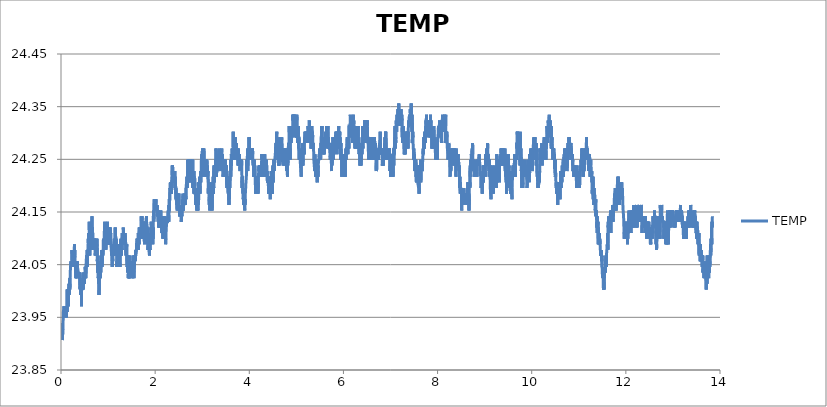
| Category | TEMP |
|---|---|
| 0.01620481575 | 23.917 |
| 0.019264157416666667 | 23.917 |
| 0.022323499055555557 | 23.939 |
| 0.025382562916666667 | 23.907 |
| 0.028442737944444445 | 23.917 |
| 0.03150207961111111 | 23.939 |
| 0.03456142125 | 23.917 |
| 0.03762076291666666 | 23.917 |
| 0.040680104555555555 | 23.928 |
| 0.04373944622222222 | 23.939 |
| 0.04679878786111111 | 23.939 |
| 0.04985785172222222 | 23.96 |
| 0.05291747116666667 | 23.96 |
| 0.055977090611111106 | 23.96 |
| 0.05903643225 | 23.96 |
| 0.062096329500000005 | 23.96 |
| 0.0651553933611111 | 23.971 |
| 0.0682155683888889 | 23.971 |
| 0.07127546561111112 | 23.971 |
| 0.07433452947222222 | 23.95 |
| 0.07739387113888889 | 23.96 |
| 0.08045349058333334 | 23.96 |
| 0.08351283222222222 | 23.95 |
| 0.0865721738888889 | 23.96 |
| 0.08963123775 | 23.95 |
| 0.09269085719444445 | 23.96 |
| 0.09575019883333334 | 23.95 |
| 0.09880926269444444 | 23.96 |
| 0.10186999330555556 | 23.95 |
| 0.10492933497222222 | 23.96 |
| 0.10798839880555555 | 23.96 |
| 0.11104774047222221 | 23.95 |
| 0.11410735991666666 | 23.971 |
| 0.11716781274999999 | 23.971 |
| 0.12022715438888888 | 23.971 |
| 0.12328677383333334 | 23.96 |
| 0.12634611547222221 | 23.971 |
| 0.12940545713888887 | 23.96 |
| 0.132464521 | 24.003 |
| 0.13552441822222222 | 23.971 |
| 0.13858375988888888 | 23.992 |
| 0.1416431015277778 | 23.971 |
| 0.14470244319444445 | 23.982 |
| 0.14776178483333335 | 23.982 |
| 0.15082112649999999 | 24.003 |
| 0.15388157930555554 | 23.992 |
| 0.15694064316666667 | 23.971 |
| 0.15999998483333333 | 23.992 |
| 0.1630604376388889 | 23.992 |
| 0.16611977930555558 | 24.003 |
| 0.16917884316666668 | 24.014 |
| 0.17223790700000002 | 23.992 |
| 0.17529752644444443 | 24.003 |
| 0.1783568681111111 | 24.014 |
| 0.18141593197222222 | 24.014 |
| 0.18447527361111113 | 24.024 |
| 0.18753461527777776 | 24.003 |
| 0.1905936791111111 | 24.014 |
| 0.19365274297222224 | 24.024 |
| 0.19671264022222223 | 24.035 |
| 0.19977198186111111 | 24.035 |
| 0.20283104572222224 | 24.046 |
| 0.20589010958333334 | 24.046 |
| 0.20894945125 | 24.046 |
| 0.21200934847222222 | 24.057 |
| 0.21506924572222222 | 24.057 |
| 0.21812969852777778 | 24.046 |
| 0.22118904019444444 | 24.046 |
| 0.22424865963888888 | 24.046 |
| 0.22730800127777778 | 24.057 |
| 0.23036706513888888 | 24.046 |
| 0.23342696238888888 | 24.078 |
| 0.2364863040277778 | 24.078 |
| 0.2395453678888889 | 24.078 |
| 0.24260498733333333 | 24.057 |
| 0.2456643289722222 | 24.078 |
| 0.2487236706388889 | 24.057 |
| 0.2517830122777778 | 24.067 |
| 0.2548429095277778 | 24.046 |
| 0.25790225116666665 | 24.057 |
| 0.2609618706111111 | 24.078 |
| 0.2640209344722222 | 24.078 |
| 0.2670802761388889 | 24.078 |
| 0.27013934 | 24.057 |
| 0.2731992372222222 | 24.078 |
| 0.2762583010833333 | 24.078 |
| 0.27931792052777776 | 24.067 |
| 0.2823772621666667 | 24.078 |
| 0.2854374372222222 | 24.089 |
| 0.2884970566666667 | 24.057 |
| 0.2915566761111111 | 24.078 |
| 0.29461657333333335 | 24.067 |
| 0.2976756371944444 | 24.067 |
| 0.30073497883333333 | 24.046 |
| 0.3037940426944445 | 24.046 |
| 0.3068533843611111 | 24.057 |
| 0.309912726 | 24.035 |
| 0.31297429 | 24.046 |
| 0.31604002091666666 | 24.024 |
| 0.3190996403611111 | 24.046 |
| 0.3221592598055556 | 24.057 |
| 0.32521887925 | 24.046 |
| 0.3282796098611111 | 24.035 |
| 0.3313403404722222 | 24.046 |
| 0.33440023772222227 | 24.046 |
| 0.3374601349722222 | 24.046 |
| 0.34052086558333333 | 24.024 |
| 0.34358131841666667 | 24.057 |
| 0.3466417712222222 | 24.057 |
| 0.3497011128888889 | 24.046 |
| 0.3527632324722222 | 24.046 |
| 0.3558228519166667 | 24.046 |
| 0.35888330475 | 24.046 |
| 0.36194570211111116 | 24.046 |
| 0.36501421097222225 | 24.046 |
| 0.36807605275 | 24.035 |
| 0.37114261705555557 | 24.024 |
| 0.3742025142777778 | 24.024 |
| 0.3772626893055555 | 24.024 |
| 0.38032453111111114 | 24.024 |
| 0.3833844283333333 | 24.035 |
| 0.38644543675 | 24.035 |
| 0.38950700075 | 24.024 |
| 0.3925688425555556 | 24.035 |
| 0.39562985097222225 | 24.035 |
| 0.3986961374722222 | 24.014 |
| 0.40175603469444443 | 24.003 |
| 0.40481593194444443 | 24.003 |
| 0.4078777737222222 | 24.003 |
| 0.41093878213888885 | 24.014 |
| 0.4139986793888889 | 24.003 |
| 0.41705913219444446 | 24.003 |
| 0.42011875163888884 | 23.992 |
| 0.42317809330555556 | 24.003 |
| 0.42623743494444444 | 24.003 |
| 0.4292970543888889 | 23.992 |
| 0.4323566738333333 | 24.003 |
| 0.43541712666666665 | 23.971 |
| 0.43847674611111115 | 24.003 |
| 0.4415388656944444 | 24.014 |
| 0.4445984851388889 | 24.003 |
| 0.44765782680555555 | 24.003 |
| 0.4507188352222222 | 24.003 |
| 0.45378539949999996 | 24.014 |
| 0.4568447411388889 | 24.014 |
| 0.4599040828055555 | 24.003 |
| 0.46296370225 | 24.024 |
| 0.46602415505555556 | 24.035 |
| 0.4690837745 | 24.003 |
| 0.4721433939722222 | 24.003 |
| 0.4752024578055556 | 24.003 |
| 0.4782617994722222 | 24.003 |
| 0.48132225230555553 | 24.003 |
| 0.48438187175 | 24.024 |
| 0.48744093558333335 | 24.014 |
| 0.4905005550277778 | 24.024 |
| 0.49355989669444444 | 24.024 |
| 0.49661896055555554 | 24.014 |
| 0.4996791355833333 | 24.024 |
| 0.5027387550277778 | 24.035 |
| 0.5057980966666666 | 24.035 |
| 0.5088577161111111 | 24.035 |
| 0.5119170577777777 | 24.024 |
| 0.5149763994166666 | 24.046 |
| 0.5180357410833333 | 24.046 |
| 0.5210950827222223 | 24.035 |
| 0.5241549799722222 | 24.046 |
| 0.5272143216111111 | 24.024 |
| 0.5302736632777778 | 24.046 |
| 0.5333330049166667 | 24.046 |
| 0.5363920687777778 | 24.057 |
| 0.5394514104166667 | 24.057 |
| 0.5425110298611111 | 24.067 |
| 0.5455706493055555 | 24.057 |
| 0.5486299909722222 | 24.067 |
| 0.5516904437777778 | 24.067 |
| 0.5547497854444444 | 24.057 |
| 0.5578096826666666 | 24.078 |
| 0.5608693021111111 | 24.046 |
| 0.5639291993611111 | 24.078 |
| 0.5669888188055555 | 24.067 |
| 0.5700489938333333 | 24.078 |
| 0.5731083355 | 24.078 |
| 0.5761676771388888 | 24.089 |
| 0.5792275743888889 | 24.099 |
| 0.5822869160277778 | 24.089 |
| 0.5853487578333333 | 24.11 |
| 0.5884086550555556 | 24.099 |
| 0.5914679967222223 | 24.089 |
| 0.5945273383611112 | 24.099 |
| 0.5975869578055555 | 24.11 |
| 0.60064657725 | 24.131 |
| 0.6037061966944445 | 24.11 |
| 0.6067652605555556 | 24.121 |
| 0.60982488 | 24.067 |
| 0.6128842216388889 | 24.089 |
| 0.6159438410833333 | 24.089 |
| 0.6190029049444444 | 24.089 |
| 0.6220628021944444 | 24.11 |
| 0.6251221438333333 | 24.121 |
| 0.6281820410833333 | 24.11 |
| 0.6312411049444444 | 24.099 |
| 0.634300724388889 | 24.089 |
| 0.6373608994166666 | 24.078 |
| 0.6404199632777777 | 24.121 |
| 0.6434793049166666 | 24.131 |
| 0.6465386465833333 | 24.089 |
| 0.6495990993888889 | 24.11 |
| 0.6526584410555555 | 24.099 |
| 0.6557175049166666 | 24.11 |
| 0.6587768465555556 | 24.142 |
| 0.6618359104166667 | 24.099 |
| 0.6648949742777778 | 24.121 |
| 0.6679545937222223 | 24.099 |
| 0.6710139353611111 | 24.121 |
| 0.6740732770277779 | 24.089 |
| 0.6771323408888889 | 24.099 |
| 0.6801922381111111 | 24.099 |
| 0.6832515797777777 | 24.089 |
| 0.6863109214166666 | 24.078 |
| 0.6893699852777778 | 24.089 |
| 0.6924296047222221 | 24.089 |
| 0.6954892241666667 | 24.089 |
| 0.6985499547777778 | 24.099 |
| 0.7016106854166666 | 24.089 |
| 0.7046700270555555 | 24.078 |
| 0.7077302020833333 | 24.099 |
| 0.7107903771111111 | 24.089 |
| 0.7138497187777778 | 24.078 |
| 0.7169090604166667 | 24.099 |
| 0.7199684020833333 | 24.089 |
| 0.7230277437222222 | 24.078 |
| 0.7260868075833333 | 24.089 |
| 0.7291461492222222 | 24.067 |
| 0.7322060464722222 | 24.078 |
| 0.7352651103333334 | 24.089 |
| 0.7383244519722223 | 24.078 |
| 0.741383793638889 | 24.078 |
| 0.7444439686666667 | 24.078 |
| 0.7475030325277777 | 24.078 |
| 0.7505623741666667 | 24.089 |
| 0.7536222714166667 | 24.099 |
| 0.756681890861111 | 24.078 |
| 0.7597412324999999 | 24.067 |
| 0.7628005741666666 | 24.089 |
| 0.765859638 | 24.099 |
| 0.7689189796666668 | 24.067 |
| 0.7719780435277778 | 24.057 |
| 0.7750371073888889 | 24.067 |
| 0.7780964490277777 | 24.057 |
| 0.7811560684722223 | 24.035 |
| 0.7842151323333333 | 24.057 |
| 0.7872805854444445 | 24.035 |
| 0.7903402048888889 | 24.046 |
| 0.7934001021111111 | 24.024 |
| 0.7964627773055555 | 24.035 |
| 0.7995229523333333 | 24.035 |
| 0.8025836829444445 | 24.014 |
| 0.8056483026944444 | 24.024 |
| 0.8087073665277777 | 23.992 |
| 0.8117678193611111 | 24.014 |
| 0.8148282721944444 | 24.046 |
| 0.8179112263055556 | 24.035 |
| 0.8210047365833334 | 24.035 |
| 0.8240715786666667 | 24.046 |
| 0.8271378651388889 | 24.024 |
| 0.8302341533611111 | 24.035 |
| 0.8332948839722222 | 24.024 |
| 0.8363586703333333 | 24.024 |
| 0.8394296793055556 | 24.035 |
| 0.8424995771111111 | 24.046 |
| 0.8455630856666667 | 24.035 |
| 0.8486377059722222 | 24.067 |
| 0.8517070481944444 | 24.057 |
| 0.8547772238055555 | 24.046 |
| 0.8578462882222223 | 24.046 |
| 0.8609147970833333 | 24.057 |
| 0.8639855282777777 | 24.057 |
| 0.8670629264999999 | 24.078 |
| 0.8701283796111111 | 24.078 |
| 0.8731957772777778 | 24.046 |
| 0.8762559523055555 | 24.078 |
| 0.8793405731944444 | 24.057 |
| 0.882412971138889 | 24.067 |
| 0.8854831467500001 | 24.078 |
| 0.888550266611111 | 24.067 |
| 0.8916207200277778 | 24.067 |
| 0.89468533975 | 24.078 |
| 0.8977502372777778 | 24.078 |
| 0.9008168015555555 | 24.099 |
| 0.9038803101111111 | 24.078 |
| 0.9069743759722222 | 24.078 |
| 0.9100401068888888 | 24.078 |
| 0.9131016708888888 | 24.089 |
| 0.9161707353055556 | 24.099 |
| 0.9192364662222222 | 24.11 |
| 0.9223096975555556 | 24.11 |
| 0.9253823733055555 | 24.121 |
| 0.92844671525 | 24.121 |
| 0.9315141129166666 | 24.131 |
| 0.9346031784722223 | 24.089 |
| 0.93768391025 | 24.078 |
| 0.9407485299722222 | 24.089 |
| 0.9438209279166666 | 24.099 |
| 0.9468924925 | 24.11 |
| 0.9499568344444445 | 24.11 |
| 0.9530231209166666 | 24.078 |
| 0.9560907963888889 | 24.099 |
| 0.9591590274444444 | 24.11 |
| 0.9622339255277779 | 24.089 |
| 0.9653029899722223 | 24.089 |
| 0.9683670541111111 | 24.089 |
| 0.9714330628055556 | 24.089 |
| 0.9744946268055557 | 24.121 |
| 0.9775598021111112 | 24.099 |
| 0.9806277553888889 | 24.099 |
| 0.9836982087777778 | 24.11 |
| 0.9867617173333334 | 24.131 |
| 0.9898296705833333 | 24.089 |
| 0.9929040130833333 | 24.099 |
| 0.9959686328333333 | 24.089 |
| 0.9990457532777778 | 24.121 |
| 1.0021114841666665 | 24.11 |
| 1.0051797152222222 | 24.089 |
| 1.0082732255 | 24.099 |
| 1.0113453456666666 | 24.11 |
| 1.0144141323055555 | 24.11 |
| 1.017506531388889 | 24.099 |
| 1.0205739290555556 | 24.089 |
| 1.0236579943333333 | 24.099 |
| 1.02672372525 | 24.089 |
| 1.029811401861111 | 24.089 |
| 1.032892967 | 24.089 |
| 1.0359750877222222 | 24.121 |
| 1.0390497080277779 | 24.089 |
| 1.0421309953888889 | 24.099 |
| 1.0452078380277778 | 24.11 |
| 1.0482696798333333 | 24.121 |
| 1.0513426333611111 | 24.089 |
| 1.0544441996666667 | 24.11 |
| 1.05753659875 | 24.099 |
| 1.0606017740833333 | 24.089 |
| 1.0636813946666666 | 24.089 |
| 1.0667543481944444 | 24.089 |
| 1.0698203569166667 | 24.089 |
| 1.072900810861111 | 24.089 |
| 1.0759909876111111 | 24.067 |
| 1.079068385861111 | 24.067 |
| 1.0821452285 | 24.078 |
| 1.0852242935 | 24.078 |
| 1.0883314156666666 | 24.046 |
| 1.0913993689166668 | 24.057 |
| 1.0944737114444445 | 24.078 |
| 1.0975466649722223 | 24.057 |
| 1.1006465645 | 24.057 |
| 1.1037395191944444 | 24.078 |
| 1.1068299737222222 | 24.067 |
| 1.1099054274166666 | 24.089 |
| 1.1130056047222223 | 24.067 |
| 1.1160841141388889 | 24.067 |
| 1.1191570676944445 | 24.078 |
| 1.1222719680833333 | 24.078 |
| 1.1253426992777777 | 24.089 |
| 1.1284198197222222 | 24.089 |
| 1.1314986069166666 | 24.099 |
| 1.1345998954166667 | 24.078 |
| 1.1376775714444445 | 24.089 |
| 1.1407677481944445 | 24.089 |
| 1.143864592 | 24.067 |
| 1.1469633803333332 | 24.099 |
| 1.150034667111111 | 24.089 |
| 1.1530981756666667 | 24.121 |
| 1.1561677956944443 | 24.078 |
| 1.1592404714444446 | 24.11 |
| 1.1623070357222223 | 24.11 |
| 1.1653749889722222 | 24.078 |
| 1.1684454423888888 | 24.089 |
| 1.17151728475 | 24.099 |
| 1.1745807933055554 | 24.078 |
| 1.1776495799444446 | 24.078 |
| 1.1807283671388888 | 24.078 |
| 1.183796876 | 24.067 |
| 1.1868745520277777 | 24.046 |
| 1.1899419496944446 | 24.057 |
| 1.1930087917777779 | 24.046 |
| 1.1960803563333333 | 24.089 |
| 1.199141086972222 | 24.067 |
| 1.2022040399166667 | 24.057 |
| 1.2052689374444445 | 24.078 |
| 1.2083402242222223 | 24.067 |
| 1.2114126221944443 | 24.078 |
| 1.2144758529444446 | 24.067 |
| 1.2175410282777777 | 24.067 |
| 1.2206195376666666 | 24.067 |
| 1.2236849907777776 | 24.067 |
| 1.226747110388889 | 24.078 |
| 1.2298114523055557 | 24.089 |
| 1.2328738496944445 | 24.067 |
| 1.2359351359166666 | 24.067 |
| 1.2390130897222222 | 24.078 |
| 1.2420793762222222 | 24.078 |
| 1.2451409402222222 | 24.078 |
| 1.2482086156944443 | 24.089 |
| 1.25127212425 | 24.046 |
| 1.2543372995555557 | 24.078 |
| 1.2574005303333333 | 24.078 |
| 1.2604654278333334 | 24.089 |
| 1.2635375480000002 | 24.089 |
| 1.2666024455277778 | 24.078 |
| 1.2696676208333333 | 24.078 |
| 1.2727280736666666 | 24.099 |
| 1.27579491575 | 24.099 |
| 1.2788553685833333 | 24.067 |
| 1.2819174881666666 | 24.078 |
| 1.2849804411388888 | 24.089 |
| 1.2880447830833333 | 24.078 |
| 1.2911080138333333 | 24.089 |
| 1.2941693000277776 | 24.078 |
| 1.297237808888889 | 24.089 |
| 1.3002988173055554 | 24.11 |
| 1.3033606590833333 | 24.099 |
| 1.3064227786666667 | 24.11 |
| 1.3094862872222222 | 24.099 |
| 1.3125764639722222 | 24.11 |
| 1.315646917388889 | 24.089 |
| 1.3187112593055557 | 24.099 |
| 1.3217733789166666 | 24.099 |
| 1.3248496659722224 | 24.121 |
| 1.3279128967222222 | 24.089 |
| 1.3309814055833333 | 24.089 |
| 1.334059081611111 | 24.099 |
| 1.3371187010555556 | 24.099 |
| 1.34018470975 | 24.11 |
| 1.34324627375 | 24.11 |
| 1.3463556182499998 | 24.11 |
| 1.3494169044722222 | 24.11 |
| 1.3524768016944444 | 24.11 |
| 1.35555447775 | 24.11 |
| 1.358627986861111 | 24.089 |
| 1.3617020515833331 | 24.11 |
| 1.3647708382222221 | 24.089 |
| 1.3678396248611113 | 24.089 |
| 1.370907578111111 | 24.099 |
| 1.373972475638889 | 24.089 |
| 1.3770398733055558 | 24.078 |
| 1.38009949275 | 24.067 |
| 1.3831646680555556 | 24.089 |
| 1.3862278988333332 | 24.078 |
| 1.3892891850277778 | 24.067 |
| 1.392348804472222 | 24.067 |
| 1.395409812888889 | 24.089 |
| 1.39852137975 | 24.089 |
| 1.4015904441666667 | 24.057 |
| 1.4046672868333334 | 24.046 |
| 1.4077335733333334 | 24.067 |
| 1.4108006931944443 | 24.046 |
| 1.41386420175 | 24.057 |
| 1.4169260435555555 | 24.057 |
| 1.419986496361111 | 24.035 |
| 1.4230477825833332 | 24.057 |
| 1.4261240696388888 | 24.046 |
| 1.4291925784722221 | 24.024 |
| 1.432258864972222 | 24.035 |
| 1.4353254292777777 | 24.035 |
| 1.4383958826666667 | 24.046 |
| 1.4414757810555556 | 24.057 |
| 1.4445415119444445 | 24.024 |
| 1.447609743 | 24.067 |
| 1.450673807138889 | 24.024 |
| 1.4537331488055556 | 24.046 |
| 1.4567994352777778 | 24.035 |
| 1.45986238825 | 24.046 |
| 1.462932008277778 | 24.035 |
| 1.4659946834444446 | 24.046 |
| 1.4690679147777779 | 24.046 |
| 1.4721311455555555 | 24.057 |
| 1.4751918761666667 | 24.057 |
| 1.4782526067777777 | 24.057 |
| 1.4813763965555555 | 24.046 |
| 1.4844396273333333 | 24.046 |
| 1.4875009135277777 | 24.057 |
| 1.4905641443055555 | 24.046 |
| 1.4936376534166667 | 24.046 |
| 1.4967033843333333 | 24.035 |
| 1.499776337861111 | 24.046 |
| 1.5028492914166665 | 24.046 |
| 1.505911411 | 24.046 |
| 1.5089813088055555 | 24.035 |
| 1.5120500954444445 | 24.046 |
| 1.5151147151666666 | 24.024 |
| 1.51817683475 | 24.046 |
| 1.5212372875833333 | 24.046 |
| 1.5242988515833333 | 24.035 |
| 1.5273584710277777 | 24.046 |
| 1.5304194794444446 | 24.067 |
| 1.5334807656388887 | 24.046 |
| 1.5365401073055556 | 24.046 |
| 1.5396027824722223 | 24.057 |
| 1.5426624019166666 | 24.035 |
| 1.5457264660555554 | 24.046 |
| 1.5487919191666666 | 24.035 |
| 1.5518590390555556 | 24.024 |
| 1.5549247699444444 | 24.057 |
| 1.5579846671944446 | 24.046 |
| 1.5610467867777778 | 24.046 |
| 1.5641205736944443 | 24.067 |
| 1.5671824155 | 24.067 |
| 1.5702423127222223 | 24.067 |
| 1.5733049879166667 | 24.067 |
| 1.5763643295555554 | 24.067 |
| 1.5794250601666666 | 24.057 |
| 1.5824849574166668 | 24.078 |
| 1.5855451324444445 | 24.067 |
| 1.588609474388889 | 24.067 |
| 1.5916727051388888 | 24.067 |
| 1.5947353803333333 | 24.067 |
| 1.5977974999166669 | 24.067 |
| 1.6008579527500002 | 24.078 |
| 1.6039203501111112 | 24.089 |
| 1.6069816363333334 | 24.089 |
| 1.610041811361111 | 24.089 |
| 1.6131008752222222 | 24.089 |
| 1.616163550388889 | 24.099 |
| 1.6192253921944444 | 24.099 |
| 1.6222955677777777 | 24.089 |
| 1.6253549094444444 | 24.089 |
| 1.6284303631111112 | 24.099 |
| 1.6314899825555556 | 24.099 |
| 1.6345507131944443 | 24.089 |
| 1.6376106104166666 | 24.099 |
| 1.6406707854444444 | 24.078 |
| 1.643730127111111 | 24.11 |
| 1.6467903021388888 | 24.099 |
| 1.6498529773055555 | 24.089 |
| 1.6529128745555555 | 24.099 |
| 1.6559774942777776 | 24.089 |
| 1.65904044725 | 24.11 |
| 1.6621000666944443 | 24.121 |
| 1.6651688533333333 | 24.121 |
| 1.6682365288055556 | 24.099 |
| 1.6713150382222224 | 24.11 |
| 1.6743749354444446 | 24.121 |
| 1.6774356660555554 | 24.121 |
| 1.6804950077222223 | 24.099 |
| 1.6835546271666666 | 24.121 |
| 1.6866184135 | 24.121 |
| 1.6896847 | 24.11 |
| 1.69274459725 | 24.099 |
| 1.6958050500555555 | 24.11 |
| 1.6988666140555557 | 24.121 |
| 1.7019287336666666 | 24.121 |
| 1.7049889086944445 | 24.142 |
| 1.7080493615277779 | 24.131 |
| 1.7111089809722222 | 24.131 |
| 1.714177212 | 24.121 |
| 1.7172376648333334 | 24.121 |
| 1.7202972842777777 | 24.142 |
| 1.723358570472222 | 24.099 |
| 1.7264223568333334 | 24.099 |
| 1.7294839208333332 | 24.11 |
| 1.7325443736666666 | 24.131 |
| 1.7356037153055557 | 24.131 |
| 1.7386691684166666 | 24.099 |
| 1.7417326769722223 | 24.099 |
| 1.7447934076111111 | 24.11 |
| 1.7478541382222224 | 24.131 |
| 1.75091431325 | 24.11 |
| 1.7539739326944443 | 24.131 |
| 1.757035218888889 | 24.131 |
| 1.7600948383333332 | 24.121 |
| 1.763155013388889 | 24.099 |
| 1.766217132972222 | 24.121 |
| 1.7692825860833332 | 24.121 |
| 1.7723613732777777 | 24.089 |
| 1.7754207149444445 | 24.121 |
| 1.7784833901111112 | 24.11 |
| 1.78154745425 | 24.11 |
| 1.7846098516388889 | 24.11 |
| 1.7876769715 | 24.099 |
| 1.7907413134444445 | 24.11 |
| 1.7938050998055557 | 24.099 |
| 1.7968841648055556 | 24.131 |
| 1.7999443398333335 | 24.131 |
| 1.8030042370555557 | 24.131 |
| 1.8060644121111111 | 24.121 |
| 1.8091287540277778 | 24.121 |
| 1.8122169862222222 | 24.121 |
| 1.815276327888889 | 24.142 |
| 1.8183365029166667 | 24.131 |
| 1.82139695575 | 24.131 |
| 1.8244587975277777 | 24.131 |
| 1.8275203615277777 | 24.131 |
| 1.8305805365555554 | 24.131 |
| 1.8336418227777778 | 24.121 |
| 1.8367042201388888 | 24.11 |
| 1.8397696732500002 | 24.089 |
| 1.8428331818055554 | 24.11 |
| 1.8458947458055557 | 24.121 |
| 1.8489554764444445 | 24.078 |
| 1.8520273188055556 | 24.089 |
| 1.855118884527778 | 24.089 |
| 1.8581798929444444 | 24.089 |
| 1.861240067972222 | 24.089 |
| 1.8643007985833333 | 24.11 |
| 1.8673623625833333 | 24.078 |
| 1.8704247599722224 | 24.078 |
| 1.8734918798333333 | 24.078 |
| 1.8765512215 | 24.078 |
| 1.879620008138889 | 24.067 |
| 1.8826857390277778 | 24.078 |
| 1.8857459140555557 | 24.089 |
| 1.888810256 | 24.078 |
| 1.8918704310277779 | 24.089 |
| 1.894933384 | 24.099 |
| 1.898012449 | 24.089 |
| 1.901074846388889 | 24.089 |
| 1.9041358548055556 | 24.089 |
| 1.9071982521666668 | 24.099 |
| 1.9102603717777777 | 24.099 |
| 1.913319991222222 | 24.121 |
| 1.9163879444722223 | 24.11 |
| 1.9194481195000002 | 24.131 |
| 1.92250801675 | 24.099 |
| 1.9255712475 | 24.11 |
| 1.9286333670833333 | 24.11 |
| 1.9316988201944443 | 24.11 |
| 1.934759828611111 | 24.11 |
| 1.937819725861111 | 24.11 |
| 1.9408860123333334 | 24.099 |
| 1.9439459095833334 | 24.11 |
| 1.9470099737222222 | 24.11 |
| 1.9500743156666667 | 24.089 |
| 1.9531350462777777 | 24.121 |
| 1.956195776888889 | 24.099 |
| 1.9592559519444444 | 24.121 |
| 1.962317793722222 | 24.142 |
| 1.9653790799444444 | 24.131 |
| 1.9684392549722223 | 24.153 |
| 1.97149943 | 24.131 |
| 1.9745584938611112 | 24.142 |
| 1.9776236691666669 | 24.163 |
| 1.9806843997777777 | 24.174 |
| 1.9837442970277779 | 24.153 |
| 1.9868041942777779 | 24.163 |
| 1.9898732586944445 | 24.153 |
| 1.9929409341666666 | 24.174 |
| 1.9960005536111112 | 24.153 |
| 1.9990648955277779 | 24.174 |
| 2.002144516138889 | 24.163 |
| 2.0052060801388887 | 24.153 |
| 2.008267644138889 | 24.174 |
| 2.0113289303333333 | 24.153 |
| 2.0143893831666664 | 24.163 |
| 2.0174495581944445 | 24.174 |
| 2.0205094554444445 | 24.163 |
| 2.0235685192777777 | 24.163 |
| 2.0266411950277776 | 24.163 |
| 2.0297088705 | 24.163 |
| 2.0327690455277776 | 24.153 |
| 2.0358292205555557 | 24.153 |
| 2.0388941180833333 | 24.153 |
| 2.0419554043055554 | 24.163 |
| 2.0450155793333336 | 24.142 |
| 2.048078810083333 | 24.142 |
| 2.0511398185 | 24.153 |
| 2.0542008269166665 | 24.153 |
| 2.05726127975 | 24.142 |
| 2.0603245105 | 24.142 |
| 2.0633994085833334 | 24.131 |
| 2.066459028027778 | 24.131 |
| 2.069520869833333 | 24.131 |
| 2.0725807670833336 | 24.153 |
| 2.0756417755 | 24.153 |
| 2.0787013949444444 | 24.121 |
| 2.0817757374444446 | 24.131 |
| 2.084835079083333 | 24.131 |
| 2.0878991432222223 | 24.121 |
| 2.0909598738611113 | 24.131 |
| 2.0940203266666666 | 24.121 |
| 2.0970796683333335 | 24.142 |
| 2.1001448436388888 | 24.121 |
| 2.103211963527778 | 24.121 |
| 2.1062874171944443 | 24.142 |
| 2.1093475922500002 | 24.121 |
| 2.1124066560833334 | 24.142 |
| 2.1154671089166666 | 24.131 |
| 2.1185381179166667 | 24.153 |
| 2.121608849083333 | 24.131 |
| 2.124671246472222 | 24.142 |
| 2.1277330882777776 | 24.142 |
| 2.1308018749166666 | 24.131 |
| 2.133861494361111 | 24.121 |
| 2.1369241695277776 | 24.142 |
| 2.1399865669166664 | 24.11 |
| 2.1430464641388887 | 24.121 |
| 2.1461077503611112 | 24.121 |
| 2.1491698699444446 | 24.11 |
| 2.1522392121666667 | 24.121 |
| 2.1552988316111112 | 24.11 |
| 2.158363729138889 | 24.11 |
| 2.161423070777778 | 24.121 |
| 2.1644824124444444 | 24.099 |
| 2.1675417540833335 | 24.131 |
| 2.17060109575 | 24.121 |
| 2.1736640486944445 | 24.131 |
| 2.1767356132777778 | 24.121 |
| 2.1797946771388887 | 24.142 |
| 2.182861519222222 | 24.131 |
| 2.1859219720555556 | 24.131 |
| 2.1889868695555554 | 24.121 |
| 2.1920492669444442 | 24.11 |
| 2.1951108309444445 | 24.11 |
| 2.198171005972222 | 24.11 |
| 2.201230069833333 | 24.11 |
| 2.2042955229444443 | 24.099 |
| 2.2073562535555555 | 24.11 |
| 2.2104178175555553 | 24.11 |
| 2.213478270388889 | 24.11 |
| 2.216538167638889 | 24.142 |
| 2.219602231777778 | 24.099 |
| 2.222669351638889 | 24.089 |
| 2.2257311934444446 | 24.089 |
| 2.2287916462777777 | 24.099 |
| 2.2318604329166667 | 24.11 |
| 2.2349253304166665 | 24.11 |
| 2.237988283388889 | 24.121 |
| 2.2410590145833336 | 24.121 |
| 2.2441236343333335 | 24.131 |
| 2.2471874206666667 | 24.131 |
| 2.250250095833333 | 24.131 |
| 2.2533113820555557 | 24.131 |
| 2.2563935027777777 | 24.131 |
| 2.2594531222222223 | 24.131 |
| 2.262512741666667 | 24.131 |
| 2.2655765280277778 | 24.131 |
| 2.2686414255555554 | 24.131 |
| 2.2717021561666666 | 24.131 |
| 2.274765664722222 | 24.131 |
| 2.277826117555555 | 24.153 |
| 2.2808943485833333 | 24.142 |
| 2.2839534124444447 | 24.153 |
| 2.2870133096944443 | 24.153 |
| 2.2900918191111113 | 24.131 |
| 2.293151994138889 | 24.163 |
| 2.2962121691666666 | 24.163 |
| 2.299273733166667 | 24.153 |
| 2.3023350193888885 | 24.174 |
| 2.305397138972222 | 24.163 |
| 2.308457314 | 24.163 |
| 2.311521933722222 | 24.185 |
| 2.3145846088888886 | 24.185 |
| 2.3176467285 | 24.196 |
| 2.320706625722222 | 24.185 |
| 2.323765967388889 | 24.206 |
| 2.326838920916667 | 24.185 |
| 2.3299004849166667 | 24.185 |
| 2.3329812166944444 | 24.206 |
| 2.3360458364166665 | 24.185 |
| 2.339108789388889 | 24.206 |
| 2.3421681310277775 | 24.185 |
| 2.3452271948888885 | 24.196 |
| 2.348287647722222 | 24.185 |
| 2.3513536564166664 | 24.185 |
| 2.3544163315833333 | 24.185 |
| 2.3574792845555557 | 24.217 |
| 2.360538626222222 | 24.217 |
| 2.363599634611111 | 24.238 |
| 2.3666606430277777 | 24.217 |
| 2.369723318222222 | 24.238 |
| 2.372783215444444 | 24.238 |
| 2.3758425571111115 | 24.228 |
| 2.3789024543333337 | 24.217 |
| 2.381962073777778 | 24.217 |
| 2.385026137916667 | 24.217 |
| 2.3880935355833333 | 24.217 |
| 2.391153155027778 | 24.206 |
| 2.3942133300833333 | 24.217 |
| 2.3972735051111114 | 24.217 |
| 2.4003334023333336 | 24.228 |
| 2.4033963553055555 | 24.206 |
| 2.406459308277778 | 24.217 |
| 2.409520594472222 | 24.217 |
| 2.412581880694445 | 24.206 |
| 2.4156490005555558 | 24.228 |
| 2.4187138980833334 | 24.217 |
| 2.4217768510555557 | 24.196 |
| 2.4248398040277777 | 24.217 |
| 2.4279216469722225 | 24.217 |
| 2.4309871000833336 | 24.196 |
| 2.434053664361111 | 24.206 |
| 2.4371141171944446 | 24.185 |
| 2.4401745700277777 | 24.196 |
| 2.44323446725 | 24.196 |
| 2.4462965868333333 | 24.174 |
| 2.4493567618611114 | 24.185 |
| 2.452416659111111 | 24.163 |
| 2.455481556638889 | 24.185 |
| 2.4585458985833335 | 24.174 |
| 2.4616049624166667 | 24.185 |
| 2.464685138611111 | 24.185 |
| 2.467746424805555 | 24.153 |
| 2.4708088221944444 | 24.163 |
| 2.4738681638333335 | 24.185 |
| 2.47692917225 | 24.174 |
| 2.479991291833333 | 24.174 |
| 2.4830581339166664 | 24.174 |
| 2.486118031166667 | 24.174 |
| 2.4891829286944445 | 24.185 |
| 2.4922422703333336 | 24.185 |
| 2.4953018897777777 | 24.174 |
| 2.498364287166667 | 24.163 |
| 2.5014277957222224 | 24.174 |
| 2.5044874151666665 | 24.185 |
| 2.507558146361111 | 24.153 |
| 2.5106222105000002 | 24.153 |
| 2.5136826633333333 | 24.163 |
| 2.5167464496666665 | 24.142 |
| 2.519819125416667 | 24.153 |
| 2.5228793004444445 | 24.153 |
| 2.5259411422499998 | 24.142 |
| 2.529001872861111 | 24.153 |
| 2.5320639924444444 | 24.163 |
| 2.5351247230833334 | 24.142 |
| 2.5381907317777777 | 24.142 |
| 2.5412500734166668 | 24.142 |
| 2.5443135819722222 | 24.142 |
| 2.547373757 | 24.153 |
| 2.5504369877777777 | 24.153 |
| 2.5534979961944444 | 24.153 |
| 2.5565581712222225 | 24.131 |
| 2.559621679777778 | 24.142 |
| 2.5626835215833332 | 24.163 |
| 2.565745363361111 | 24.153 |
| 2.5688083163333335 | 24.142 |
| 2.5718687691666666 | 24.142 |
| 2.574928666388889 | 24.163 |
| 2.5779902303888886 | 24.163 |
| 2.581052627777778 | 24.153 |
| 2.584111969416667 | 24.174 |
| 2.587173255638889 | 24.174 |
| 2.5902350974166666 | 24.174 |
| 2.593294439083333 | 24.185 |
| 2.5963573920555554 | 24.163 |
| 2.5994175670833335 | 24.174 |
| 2.6024780199166666 | 24.153 |
| 2.6055404172777776 | 24.153 |
| 2.608600314527778 | 24.174 |
| 2.6116635452777777 | 24.174 |
| 2.6147309429444445 | 24.163 |
| 2.617792229166667 | 24.163 |
| 2.6208579600555555 | 24.163 |
| 2.6239242465555557 | 24.174 |
| 2.626987477333333 | 24.185 |
| 2.6300473745555553 | 24.163 |
| 2.633107827388889 | 24.174 |
| 2.636168002416667 | 24.185 |
| 2.6392351223055552 | 24.163 |
| 2.6422961306944446 | 24.185 |
| 2.6453663063055557 | 24.185 |
| 2.648430092666667 | 24.185 |
| 2.6514911010833333 | 24.185 |
| 2.6545554429999996 | 24.174 |
| 2.65761534025 | 24.196 |
| 2.660674404111111 | 24.196 |
| 2.6637370792777775 | 24.196 |
| 2.6667972543055556 | 24.206 |
| 2.6698574293333333 | 24.206 |
| 2.6729173265833333 | 24.196 |
| 2.6759813907222223 | 24.217 |
| 2.679042676944445 | 24.217 |
| 2.682102574166667 | 24.196 |
| 2.6851688606666664 | 24.206 |
| 2.6882357027499997 | 24.228 |
| 2.691296988944444 | 24.206 |
| 2.6943577195833335 | 24.249 |
| 2.6974228948888888 | 24.228 |
| 2.700486125638889 | 24.217 |
| 2.7035457450833333 | 24.206 |
| 2.7066075868888886 | 24.228 |
| 2.709669150888889 | 24.228 |
| 2.712737104138889 | 24.238 |
| 2.7157995015277776 | 24.249 |
| 2.7188591209722226 | 24.217 |
| 2.7219240184999998 | 24.249 |
| 2.7249933607222223 | 24.228 |
| 2.7280554803055557 | 24.217 |
| 2.7311178776944445 | 24.228 |
| 2.734183886388889 | 24.249 |
| 2.7372443392222223 | 24.228 |
| 2.7403114590833337 | 24.238 |
| 2.7433744120555557 | 24.249 |
| 2.746450699111111 | 24.228 |
| 2.7495136520833334 | 24.238 |
| 2.752575771666667 | 24.228 |
| 2.7556381690555556 | 24.238 |
| 2.7587025109999996 | 24.238 |
| 2.761772964388889 | 24.206 |
| 2.7648325838333334 | 24.206 |
| 2.767893314444444 | 24.206 |
| 2.7709537672777778 | 24.217 |
| 2.7740150535 | 24.238 |
| 2.7770788398333335 | 24.217 |
| 2.780139014861111 | 24.228 |
| 2.783202801222222 | 24.217 |
| 2.7862649208055554 | 24.249 |
| 2.78932454025 | 24.217 |
| 2.7923872154166665 | 24.196 |
| 2.795449057222222 | 24.217 |
| 2.7985172882777776 | 24.249 |
| 2.8015791300555555 | 24.228 |
| 2.804646805527778 | 24.217 |
| 2.8077069805555555 | 24.206 |
| 2.8107702113055555 | 24.217 |
| 2.8138301085555555 | 24.228 |
| 2.8168900058055555 | 24.217 |
| 2.8199532365555555 | 24.217 |
| 2.8230511915277776 | 24.228 |
| 2.826115533472222 | 24.185 |
| 2.8291754306944443 | 24.217 |
| 2.832235050138889 | 24.206 |
| 2.8352988365 | 24.206 |
| 2.838358178138889 | 24.217 |
| 2.8414211311111113 | 24.217 |
| 2.844484361888889 | 24.185 |
| 2.8475573154166662 | 24.196 |
| 2.8506191572222224 | 24.196 |
| 2.853681832388889 | 24.196 |
| 2.8567556193055554 | 24.196 |
| 2.859816627722222 | 24.174 |
| 2.862887358916667 | 24.185 |
| 2.865948089527778 | 24.163 |
| 2.869008542361111 | 24.196 |
| 2.872068717388889 | 24.185 |
| 2.875130836972222 | 24.163 |
| 2.878191012 | 24.174 |
| 2.8812550761666667 | 24.163 |
| 2.8843188625 | 24.174 |
| 2.88737875975 | 24.153 |
| 2.8904522688611114 | 24.163 |
| 2.893512166111111 | 24.153 |
| 2.896572896722222 | 24.153 |
| 2.899634738527778 | 24.163 |
| 2.9027035251666664 | 24.185 |
| 2.9057673115 | 24.163 |
| 2.908830820055556 | 24.153 |
| 2.9118982177222223 | 24.174 |
| 2.9149642264166666 | 24.174 |
| 2.918025790416667 | 24.206 |
| 2.9210898545833333 | 24.163 |
| 2.9241533631388887 | 24.174 |
| 2.927241873111111 | 24.185 |
| 2.930330383111111 | 24.185 |
| 2.933400003111111 | 24.185 |
| 2.936462122694444 | 24.185 |
| 2.9395225755277776 | 24.185 |
| 2.942585806305556 | 24.185 |
| 2.945646259111111 | 24.185 |
| 2.9487106010555553 | 24.217 |
| 2.951780498861111 | 24.185 |
| 2.9548423406666666 | 24.206 |
| 2.9579091827500004 | 24.217 |
| 2.9609715801111114 | 24.217 |
| 2.9640334219166666 | 24.206 |
| 2.967097208277778 | 24.228 |
| 2.9701565499166667 | 24.206 |
| 2.9732195028888886 | 24.228 |
| 2.976280789083333 | 24.217 |
| 2.979340964111111 | 24.228 |
| 2.9824114175277776 | 24.249 |
| 2.985472148138889 | 24.217 |
| 2.9885331565555555 | 24.26 |
| 2.9915936093888886 | 24.26 |
| 2.99465434 | 24.238 |
| 2.997715904 | 24.249 |
| 3.0007771901944444 | 24.228 |
| 3.0038390319999997 | 24.27 |
| 3.006912541138889 | 24.249 |
| 3.0099729939444444 | 24.249 |
| 3.01306511525 | 24.249 |
| 3.016126401472222 | 24.249 |
| 3.0191957436944445 | 24.26 |
| 3.022257029888889 | 24.249 |
| 3.0253180383055556 | 24.249 |
| 3.0283812690555556 | 24.249 |
| 3.0314714458055554 | 24.238 |
| 3.034538010111111 | 24.27 |
| 3.0375970739722225 | 24.27 |
| 3.0406589157500004 | 24.238 |
| 3.043722702111111 | 24.217 |
| 3.046788155222222 | 24.228 |
| 3.0498502748055554 | 24.249 |
| 3.0529096164444445 | 24.249 |
| 3.055970069277778 | 24.249 |
| 3.059034689 | 24.238 |
| 3.0620979197777776 | 24.238 |
| 3.065157539222222 | 24.228 |
| 3.0682213255555557 | 24.249 |
| 3.0712826117777774 | 24.249 |
| 3.0743425089999996 | 24.238 |
| 3.0774051841944443 | 24.238 |
| 3.080468970527778 | 24.228 |
| 3.0835285899722225 | 24.228 |
| 3.0865904317777777 | 24.238 |
| 3.0896522735833334 | 24.249 |
| 3.0927118930277775 | 24.238 |
| 3.095778457305556 | 24.238 |
| 3.09883807675 | 24.249 |
| 3.1019024186944444 | 24.217 |
| 3.1049631493055556 | 24.228 |
| 3.1080244355 | 24.228 |
| 3.111088499638889 | 24.238 |
| 3.1141970107777777 | 24.217 |
| 3.1172574636111112 | 24.217 |
| 3.1203256946666666 | 24.217 |
| 3.123385591888889 | 24.228 |
| 3.126452433972222 | 24.206 |
| 3.1295173315 | 24.185 |
| 3.1325872293055554 | 24.206 |
| 3.135647126555556 | 24.196 |
| 3.1387173021388888 | 24.196 |
| 3.1417769215833333 | 24.196 |
| 3.144836541027778 | 24.185 |
| 3.147896993861111 | 24.163 |
| 3.1509566133055555 | 24.174 |
| 3.1540203996666665 | 24.185 |
| 3.1570811302777777 | 24.174 |
| 3.160141305305556 | 24.153 |
| 3.1632059250555553 | 24.153 |
| 3.1662672112499997 | 24.185 |
| 3.1693387758333333 | 24.185 |
| 3.172400062027778 | 24.185 |
| 3.1754649595555557 | 24.206 |
| 3.1785262457499996 | 24.196 |
| 3.181586143 | 24.196 |
| 3.1846482625833334 | 24.196 |
| 3.1877081598333334 | 24.185 |
| 3.190768612638889 | 24.185 |
| 3.1938343435555554 | 24.174 |
| 3.196922020166667 | 24.163 |
| 3.1999835841666666 | 24.174 |
| 3.203043203611111 | 24.163 |
| 3.206103378638889 | 24.185 |
| 3.209166609388889 | 24.153 |
| 3.212227340027778 | 24.163 |
| 3.2152902930000002 | 24.163 |
| 3.218351857 | 24.185 |
| 3.221413143194445 | 24.196 |
| 3.224473318222222 | 24.196 |
| 3.2275326598888885 | 24.185 |
| 3.23059505725 | 24.185 |
| 3.233660510361111 | 24.217 |
| 3.2367234633333335 | 24.185 |
| 3.2397850273333333 | 24.217 |
| 3.2428479803055557 | 24.196 |
| 3.245908710916667 | 24.228 |
| 3.2489736084444445 | 24.238 |
| 3.2520390615555557 | 24.217 |
| 3.255098403222222 | 24.217 |
| 3.258159411638889 | 24.217 |
| 3.261224031361111 | 24.206 |
| 3.264283650805556 | 24.238 |
| 3.2673541041944443 | 24.217 |
| 3.2704156681944445 | 24.217 |
| 3.2734752876388886 | 24.217 |
| 3.2765354626666667 | 24.228 |
| 3.2796006380000002 | 24.228 |
| 3.2826627575833336 | 24.217 |
| 3.285725710555556 | 24.249 |
| 3.2887911636666662 | 24.249 |
| 3.2918505053055553 | 24.238 |
| 3.294910958138889 | 24.27 |
| 3.29797168875 | 24.27 |
| 3.3010338083333335 | 24.228 |
| 3.304093983388889 | 24.217 |
| 3.3071544361944447 | 24.217 |
| 3.310218222555555 | 24.217 |
| 3.313277842 | 24.249 |
| 3.3163369058611107 | 24.228 |
| 3.31940735925 | 24.249 |
| 3.3224708678055555 | 24.228 |
| 3.3255321540277776 | 24.228 |
| 3.32859205125 | 24.249 |
| 3.331660282305555 | 24.228 |
| 3.3347204573333333 | 24.238 |
| 3.3377842436944447 | 24.249 |
| 3.340844974305556 | 24.238 |
| 3.3439065383055553 | 24.249 |
| 3.3469675467222224 | 24.26 |
| 3.3500274439444446 | 24.249 |
| 3.353092063694444 | 24.249 |
| 3.3561516831388887 | 24.238 |
| 3.3592149138888887 | 24.249 |
| 3.3622753667222223 | 24.27 |
| 3.3653372085 | 24.27 |
| 3.368404328388889 | 24.249 |
| 3.3714656145833337 | 24.238 |
| 3.3745269008055554 | 24.238 |
| 3.3775904093611113 | 24.238 |
| 3.3806500288055554 | 24.249 |
| 3.383715481916667 | 24.249 |
| 3.3867753791388893 | 24.249 |
| 3.389838332111111 | 24.26 |
| 3.392898507138889 | 24.238 |
| 3.395959793361111 | 24.238 |
| 3.399019968388889 | 24.228 |
| 3.402081532388889 | 24.26 |
| 3.405140874027778 | 24.228 |
| 3.408200771277778 | 24.249 |
| 3.411271502472222 | 24.249 |
| 3.414330844111111 | 24.27 |
| 3.4173932415 | 24.27 |
| 3.4204528609444442 | 24.238 |
| 3.4235119248055557 | 24.249 |
| 3.426574322194444 | 24.238 |
| 3.4296411642777773 | 24.26 |
| 3.4327030060555557 | 24.238 |
| 3.435762347722222 | 24.249 |
| 3.438821689361111 | 24.228 |
| 3.441881586611111 | 24.217 |
| 3.44494565075 | 24.217 |
| 3.4480113816388887 | 24.228 |
| 3.4510732234444443 | 24.238 |
| 3.4541331206944443 | 24.228 |
| 3.457193295722222 | 24.228 |
| 3.460254304138889 | 24.217 |
| 3.4633150347500004 | 24.228 |
| 3.4663763209444443 | 24.238 |
| 3.46943816275 | 24.228 |
| 3.4725011157222223 | 24.238 |
| 3.4755612907500004 | 24.228 |
| 3.478621187972222 | 24.249 |
| 3.481682196388889 | 24.217 |
| 3.4847451493611112 | 24.217 |
| 3.48780588 | 24.228 |
| 3.490865221638889 | 24.217 |
| 3.493926230055555 | 24.249 |
| 3.4969880718333335 | 24.228 |
| 3.5000532471666665 | 24.238 |
| 3.5031137 | 24.217 |
| 3.5061758195833335 | 24.228 |
| 3.5092365501944442 | 24.217 |
| 3.5122978363888886 | 24.217 |
| 3.5153605115833333 | 24.238 |
| 3.518420964388889 | 24.206 |
| 3.521493362361111 | 24.228 |
| 3.524552981805556 | 24.196 |
| 3.52761260125 | 24.196 |
| 3.5306802766944445 | 24.217 |
| 3.5337429518888888 | 24.206 |
| 3.536806182638889 | 24.196 |
| 3.5398688578055553 | 24.217 |
| 3.542930699611111 | 24.206 |
| 3.545995041555556 | 24.196 |
| 3.549056049972222 | 24.196 |
| 3.552117058388889 | 24.185 |
| 3.555179177972222 | 24.196 |
| 3.558240186388889 | 24.196 |
| 3.5613003614166665 | 24.196 |
| 3.5643602586388887 | 24.196 |
| 3.567426545138889 | 24.196 |
| 3.5704861645833335 | 24.163 |
| 3.5735460618333335 | 24.196 |
| 3.5766106815555556 | 24.174 |
| 3.5796708565833333 | 24.206 |
| 3.582734642944444 | 24.217 |
| 3.5857953735555554 | 24.196 |
| 3.588856381972222 | 24.217 |
| 3.5919207239166666 | 24.217 |
| 3.5949797877500003 | 24.217 |
| 3.5980566304166666 | 24.228 |
| 3.601117361027778 | 24.238 |
| 3.604180314 | 24.249 |
| 3.6072399334444447 | 24.217 |
| 3.6103034419999998 | 24.238 |
| 3.613364172611111 | 24.238 |
| 3.6164240698611114 | 24.249 |
| 3.6194836893055555 | 24.26 |
| 3.622544697722222 | 24.238 |
| 3.6256070951111115 | 24.26 |
| 3.6286678257222222 | 24.249 |
| 3.6317296674999997 | 24.26 |
| 3.634789009166667 | 24.27 |
| 3.6378483508055552 | 24.27 |
| 3.6409082480555557 | 24.26 |
| 3.6439678675 | 24.26 |
| 3.647029987083333 | 24.27 |
| 3.6500904399166667 | 24.249 |
| 3.653156448611111 | 24.27 |
| 3.65622523525 | 24.26 |
| 3.6592848546944445 | 24.303 |
| 3.6623447519166668 | 24.27 |
| 3.66540520475 | 24.27 |
| 3.6684651020000003 | 24.27 |
| 3.671524999222222 | 24.27 |
| 3.6745846186666666 | 24.27 |
| 3.677643960333333 | 24.292 |
| 3.6807102468055555 | 24.249 |
| 3.683772088611111 | 24.281 |
| 3.686834486 | 24.27 |
| 3.68989605 | 24.27 |
| 3.6929562250277774 | 24.27 |
| 3.6960155666666665 | 24.281 |
| 3.699076297305556 | 24.26 |
| 3.70213591675 | 24.27 |
| 3.7052013698611113 | 24.281 |
| 3.7082607115 | 24.292 |
| 3.711321442111111 | 24.27 |
| 3.7143827283333333 | 24.281 |
| 3.7174470702777778 | 24.26 |
| 3.720507245305556 | 24.27 |
| 3.723571865027778 | 24.281 |
| 3.726631484472222 | 24.27 |
| 3.7296958264166666 | 24.27 |
| 3.732756557027778 | 24.27 |
| 3.73581784325 | 24.27 |
| 3.7388780182777777 | 24.26 |
| 3.74194430475 | 24.26 |
| 3.7450053131666667 | 24.27 |
| 3.7480924341944446 | 24.249 |
| 3.7511520536388887 | 24.249 |
| 3.75421584 | 24.26 |
| 3.7572865711666665 | 24.249 |
| 3.760347024 | 24.238 |
| 3.763411921527778 | 24.238 |
| 3.766472652138889 | 24.27 |
| 3.7695358829166667 | 24.238 |
| 3.7725977246944447 | 24.238 |
| 3.7756615110555556 | 24.26 |
| 3.7787244640277775 | 24.249 |
| 3.781786583611111 | 24.249 |
| 3.784848147611111 | 24.249 |
| 3.7879138785277777 | 24.249 |
| 3.790974609138889 | 24.26 |
| 3.794037284305556 | 24.238 |
| 3.797099126111111 | 24.238 |
| 3.8001773577222226 | 24.238 |
| 3.8032369771666668 | 24.228 |
| 3.80629909675 | 24.238 |
| 3.8093598273888887 | 24.249 |
| 3.812419724611111 | 24.238 |
| 3.8154790662777778 | 24.238 |
| 3.8185400746666662 | 24.238 |
| 3.8216005275 | 24.249 |
| 3.8246598691666667 | 24.238 |
| 3.827727544611111 | 24.228 |
| 3.83081855475 | 24.238 |
| 3.833889563722222 | 24.238 |
| 3.8369494609722223 | 24.249 |
| 3.8400096359999996 | 24.238 |
| 3.8430756446944447 | 24.217 |
| 3.8461444313333333 | 24.196 |
| 3.8492059953333335 | 24.217 |
| 3.8522672815555556 | 24.206 |
| 3.855342735222222 | 24.217 |
| 3.8584040214444446 | 24.217 |
| 3.861464196472222 | 24.196 |
| 3.864523538111111 | 24.185 |
| 3.8675839909444445 | 24.185 |
| 3.870644999361111 | 24.196 |
| 3.873705729972222 | 24.174 |
| 3.876765627222222 | 24.185 |
| 3.8798285801666665 | 24.163 |
| 3.8828887552222224 | 24.185 |
| 3.885950597 | 24.185 |
| 3.8890141055555554 | 24.185 |
| 3.8920748361944444 | 24.185 |
| 3.895134455638889 | 24.163 |
| 3.898197408583333 | 24.163 |
| 3.9012598059722223 | 24.163 |
| 3.904328592611111 | 24.153 |
| 3.9073946013055556 | 24.174 |
| 3.9104578320833334 | 24.163 |
| 3.9135196738611113 | 24.174 |
| 3.916586238166667 | 24.185 |
| 3.9196466909722223 | 24.185 |
| 3.922707699388889 | 24.196 |
| 3.9257673188333335 | 24.196 |
| 3.928829438416667 | 24.206 |
| 3.931899336222222 | 24.206 |
| 3.9349589556666666 | 24.206 |
| 3.9380202418888888 | 24.217 |
| 3.941084306027778 | 24.217 |
| 3.9441447588611114 | 24.249 |
| 3.9472093785833335 | 24.228 |
| 3.950273442722222 | 24.228 |
| 3.953334173361111 | 24.238 |
| 3.9563960151388886 | 24.249 |
| 3.959458412527778 | 24.249 |
| 3.9625213655000002 | 24.249 |
| 3.9655954301944445 | 24.27 |
| 3.968659216555556 | 24.228 |
| 3.971730781138889 | 24.249 |
| 3.9747906783611113 | 24.26 |
| 3.9778502978055554 | 24.27 |
| 3.980910195055556 | 24.249 |
| 3.983970092277778 | 24.26 |
| 3.9870361009999997 | 24.249 |
| 3.990102387472222 | 24.26 |
| 3.993170340722222 | 24.249 |
| 3.9962327381111113 | 24.292 |
| 3.9992945799166666 | 24.27 |
| 4.002361144194444 | 24.292 |
| 4.005422152611112 | 24.292 |
| 4.008481494250001 | 24.26 |
| 4.011541113694444 | 24.27 |
| 4.014607955777778 | 24.27 |
| 4.01767090875 | 24.27 |
| 4.0207344173055555 | 24.27 |
| 4.0237943145555555 | 24.249 |
| 4.026860878833333 | 24.249 |
| 4.029927998722222 | 24.26 |
| 4.032989284916667 | 24.26 |
| 4.036050015527778 | 24.26 |
| 4.039112135111111 | 24.26 |
| 4.042172587944445 | 24.26 |
| 4.045232207388889 | 24.26 |
| 4.0482915490555555 | 24.27 |
| 4.051354502000001 | 24.26 |
| 4.05441439925 | 24.27 |
| 4.05747596325 | 24.26 |
| 4.0605355826944445 | 24.27 |
| 4.063619925777778 | 24.27 |
| 4.066679545222222 | 24.26 |
| 4.06973972025 | 24.27 |
| 4.072799061916666 | 24.26 |
| 4.075863681638889 | 24.249 |
| 4.078925801222222 | 24.249 |
| 4.082001254916666 | 24.238 |
| 4.085068930361111 | 24.249 |
| 4.088132716722222 | 24.238 |
| 4.091193447333334 | 24.228 |
| 4.094259456027777 | 24.238 |
| 4.097321853416667 | 24.217 |
| 4.100388973277777 | 24.238 |
| 4.103451092888889 | 24.228 |
| 4.106526546555556 | 24.249 |
| 4.1095939442222225 | 24.238 |
| 4.112659397333333 | 24.228 |
| 4.115730406333333 | 24.238 |
| 4.118794470472222 | 24.238 |
| 4.121854367694445 | 24.238 |
| 4.124913431555556 | 24.217 |
| 4.127977495722222 | 24.217 |
| 4.13103767075 | 24.196 |
| 4.134102568277778 | 24.185 |
| 4.137162187722222 | 24.217 |
| 4.140225418472222 | 24.217 |
| 4.143287815861111 | 24.206 |
| 4.146348824277778 | 24.206 |
| 4.149415388555555 | 24.217 |
| 4.1524780637222225 | 24.217 |
| 4.155540738888889 | 24.217 |
| 4.15860452525 | 24.196 |
| 4.161664700277777 | 24.196 |
| 4.164750987916666 | 24.196 |
| 4.16781144075 | 24.206 |
| 4.170872449166667 | 24.196 |
| 4.173934846527778 | 24.217 |
| 4.17699613275 | 24.185 |
| 4.180058807916667 | 24.206 |
| 4.183126205583333 | 24.217 |
| 4.186186658416667 | 24.185 |
| 4.189246277861111 | 24.206 |
| 4.192306730694445 | 24.217 |
| 4.195366072333333 | 24.217 |
| 4.198430136472222 | 24.217 |
| 4.2014997565000005 | 24.228 |
| 4.204565765194444 | 24.238 |
| 4.207629551555556 | 24.228 |
| 4.210689171 | 24.228 |
| 4.2137490682222225 | 24.228 |
| 4.216816743694444 | 24.238 |
| 4.2198771965277775 | 24.228 |
| 4.222939593888889 | 24.228 |
| 4.22599865775 | 24.217 |
| 4.2290582771944445 | 24.217 |
| 4.232119841194444 | 24.228 |
| 4.235185572111111 | 24.217 |
| 4.238246024916666 | 24.217 |
| 4.241305644361111 | 24.217 |
| 4.244365263805555 | 24.238 |
| 4.2474407175 | 24.217 |
| 4.250501170333333 | 24.228 |
| 4.253564956666667 | 24.238 |
| 4.256625965083333 | 24.228 |
| 4.259685862333334 | 24.238 |
| 4.262747981916667 | 24.249 |
| 4.265810934888889 | 24.26 |
| 4.268870276527777 | 24.249 |
| 4.271932118333334 | 24.26 |
| 4.274999516 | 24.249 |
| 4.2780610800000005 | 24.26 |
| 4.2811245885555556 | 24.238 |
| 4.284186430361111 | 24.249 |
| 4.287253828027778 | 24.249 |
| 4.290319281138888 | 24.217 |
| 4.293379456166667 | 24.238 |
| 4.296444075888889 | 24.228 |
| 4.299509251194444 | 24.238 |
| 4.302568870666667 | 24.238 |
| 4.305639601833334 | 24.228 |
| 4.308699776888889 | 24.249 |
| 4.3117655077777775 | 24.26 |
| 4.314828182944445 | 24.26 |
| 4.317896414 | 24.249 |
| 4.32095631125 | 24.228 |
| 4.324016764055556 | 24.217 |
| 4.327081661583334 | 24.249 |
| 4.330143503388888 | 24.26 |
| 4.333205900777778 | 24.228 |
| 4.336268575944445 | 24.228 |
| 4.33933041775 | 24.228 |
| 4.342390037194445 | 24.249 |
| 4.345452712361111 | 24.249 |
| 4.3485262214722225 | 24.238 |
| 4.351588341083334 | 24.238 |
| 4.354648238305556 | 24.238 |
| 4.35771258025 | 24.238 |
| 4.360775811 | 24.217 |
| 4.3638365416388885 | 24.238 |
| 4.3668989389999995 | 24.249 |
| 4.369961891972222 | 24.228 |
| 4.373027345083333 | 24.228 |
| 4.376086964527778 | 24.217 |
| 4.379148528527778 | 24.228 |
| 4.382208147972222 | 24.228 |
| 4.3852686008055555 | 24.206 |
| 4.388329609222222 | 24.217 |
| 4.391395340138889 | 24.217 |
| 4.3944577375 | 24.206 |
| 4.397522635027777 | 24.217 |
| 4.400588921527778 | 24.217 |
| 4.4036518745 | 24.206 |
| 4.4067214945 | 24.196 |
| 4.4097836140833335 | 24.185 |
| 4.412845733694445 | 24.185 |
| 4.41591729825 | 24.196 |
| 4.418976639916667 | 24.196 |
| 4.422037370527778 | 24.217 |
| 4.425097267777778 | 24.185 |
| 4.428156887222222 | 24.185 |
| 4.431216228861111 | 24.196 |
| 4.434279459611111 | 24.196 |
| 4.4373385234722225 | 24.206 |
| 4.440399809694445 | 24.206 |
| 4.443462207055556 | 24.185 |
| 4.446523771055555 | 24.174 |
| 4.4495833905 | 24.206 |
| 4.45264328775 | 24.217 |
| 4.455704018361111 | 24.206 |
| 4.458763915611112 | 24.217 |
| 4.461826035194445 | 24.217 |
| 4.464885376861111 | 24.196 |
| 4.467945829666666 | 24.228 |
| 4.471008227055555 | 24.217 |
| 4.474069235472222 | 24.206 |
| 4.4771294105 | 24.196 |
| 4.480190418916666 | 24.196 |
| 4.483250038361111 | 24.185 |
| 4.486310213388889 | 24.196 |
| 4.489372055194444 | 24.206 |
| 4.492433896972222 | 24.185 |
| 4.495494349805556 | 24.217 |
| 4.498559247333334 | 24.206 |
| 4.5016222003055555 | 24.238 |
| 4.504687931194445 | 24.206 |
| 4.507752828722222 | 24.217 |
| 4.5108132815555555 | 24.217 |
| 4.513878734666666 | 24.228 |
| 4.5169402986666665 | 24.238 |
| 4.5200043628055555 | 24.228 |
| 4.523065093416666 | 24.249 |
| 4.5261277686111105 | 24.238 |
| 4.529188499222222 | 24.228 |
| 4.532247840861111 | 24.249 |
| 4.535309127083333 | 24.238 |
| 4.538370413277778 | 24.238 |
| 4.5414305883055555 | 24.249 |
| 4.544494096861111 | 24.249 |
| 4.547570383944445 | 24.249 |
| 4.550630003388889 | 24.249 |
| 4.553703512499999 | 24.26 |
| 4.556766465472222 | 24.27 |
| 4.559828029472222 | 24.27 |
| 4.562887926722222 | 24.27 |
| 4.565951435277778 | 24.281 |
| 4.569012443694444 | 24.281 |
| 4.572079841361111 | 24.281 |
| 4.575143627694445 | 24.281 |
| 4.578207414055556 | 24.26 |
| 4.581277867444444 | 24.303 |
| 4.584342764972222 | 24.292 |
| 4.587404051194444 | 24.281 |
| 4.59047089325 | 24.27 |
| 4.593530512694445 | 24.292 |
| 4.596593187888889 | 24.27 |
| 4.599656418638888 | 24.281 |
| 4.6027174270555555 | 24.27 |
| 4.605782324583333 | 24.27 |
| 4.608847222111111 | 24.281 |
| 4.6119085083055555 | 24.249 |
| 4.614975072611111 | 24.281 |
| 4.618035247638889 | 24.249 |
| 4.621094867083333 | 24.249 |
| 4.624158931222222 | 24.238 |
| 4.627219939638889 | 24.249 |
| 4.630289837444444 | 24.27 |
| 4.633350845861111 | 24.238 |
| 4.636411298694444 | 24.281 |
| 4.639478696361111 | 24.26 |
| 4.642543038277778 | 24.281 |
| 4.645609324777778 | 24.27 |
| 4.648674222305556 | 24.281 |
| 4.651740786583333 | 24.27 |
| 4.654800683833334 | 24.27 |
| 4.657861970027778 | 24.27 |
| 4.660926034166667 | 24.292 |
| 4.663986487 | 24.26 |
| 4.667048050999999 | 24.27 |
| 4.670107392666667 | 24.281 |
| 4.6731664565 | 24.281 |
| 4.676237187694444 | 24.27 |
| 4.679297640527778 | 24.27 |
| 4.6823617046666675 | 24.281 |
| 4.685423268666667 | 24.281 |
| 4.688482610333334 | 24.281 |
| 4.691545007694445 | 24.292 |
| 4.694607682888889 | 24.249 |
| 4.697670635861112 | 24.27 |
| 4.700730810888889 | 24.249 |
| 4.703792097083333 | 24.249 |
| 4.7068525499166665 | 24.249 |
| 4.709914113916667 | 24.249 |
| 4.712973455555556 | 24.249 |
| 4.716033352805556 | 24.249 |
| 4.7190971391388885 | 24.238 |
| 4.722157314194444 | 24.238 |
| 4.725238879333333 | 24.249 |
| 4.728300721111111 | 24.249 |
| 4.731369785555556 | 24.26 |
| 4.7344341275 | 24.27 |
| 4.737495135888889 | 24.249 |
| 4.740555310944444 | 24.238 |
| 4.7436185416944445 | 24.27 |
| 4.746679272305555 | 24.27 |
| 4.749740558527778 | 24.249 |
| 4.7528049004722215 | 24.26 |
| 4.7558672978333325 | 24.27 |
| 4.758926917277778 | 24.26 |
| 4.761988481277777 | 24.26 |
| 4.765049489694444 | 24.27 |
| 4.768114387222222 | 24.249 |
| 4.771175117833333 | 24.249 |
| 4.774235292861111 | 24.27 |
| 4.777297690249999 | 24.249 |
| 4.780361198805555 | 24.238 |
| 4.783424985166667 | 24.238 |
| 4.78648710475 | 24.238 |
| 4.7895472797777785 | 24.238 |
| 4.792607732611112 | 24.249 |
| 4.795670407777777 | 24.228 |
| 4.798729749444444 | 24.249 |
| 4.801791313444444 | 24.249 |
| 4.80485648875 | 24.228 |
| 4.807926664361111 | 24.228 |
| 4.810988783944444 | 24.217 |
| 4.814053125888889 | 24.249 |
| 4.817116356638889 | 24.238 |
| 4.820179309611111 | 24.238 |
| 4.823255596666667 | 24.249 |
| 4.826323272138889 | 24.249 |
| 4.829392614361112 | 24.27 |
| 4.832451956000001 | 24.281 |
| 4.83552046486111 | 24.249 |
| 4.838611752777778 | 24.281 |
| 4.841675539111111 | 24.281 |
| 4.844736547527778 | 24.27 |
| 4.84779783375 | 24.27 |
| 4.850857175388889 | 24.313 |
| 4.853916517055556 | 24.27 |
| 4.856975858694445 | 24.26 |
| 4.860034922555555 | 24.26 |
| 4.863101209055555 | 24.27 |
| 4.866167773333333 | 24.27 |
| 4.869231281888888 | 24.249 |
| 4.872294790444444 | 24.292 |
| 4.875355521055555 | 24.281 |
| 4.878415973888889 | 24.292 |
| 4.881477260083334 | 24.292 |
| 4.8845368795277775 | 24.303 |
| 4.887598443527778 | 24.281 |
| 4.890660007555556 | 24.292 |
| 4.893719904777778 | 24.313 |
| 4.896780079805556 | 24.313 |
| 4.899846366305556 | 24.313 |
| 4.902908208111111 | 24.303 |
| 4.905967827555556 | 24.303 |
| 4.909028558166667 | 24.292 |
| 4.912089011 | 24.303 |
| 4.915150297194444 | 24.313 |
| 4.918210472222222 | 24.292 |
| 4.92127759211111 | 24.313 |
| 4.9243386005 | 24.335 |
| 4.927398219972223 | 24.335 |
| 4.930459506166667 | 24.324 |
| 4.933519125611111 | 24.335 |
| 4.936578189472223 | 24.324 |
| 4.939639475666667 | 24.324 |
| 4.9427040954166666 | 24.335 |
| 4.94576315925 | 24.335 |
| 4.94882388988889 | 24.335 |
| 4.951887120638889 | 24.335 |
| 4.954948962444444 | 24.324 |
| 4.958011915416667 | 24.313 |
| 4.9610709792500005 | 24.303 |
| 4.9641350434166664 | 24.335 |
| 4.96719882975 | 24.313 |
| 4.970259004777779 | 24.313 |
| 4.973318624222222 | 24.303 |
| 4.976392133361111 | 24.313 |
| 4.979452308388889 | 24.324 |
| 4.982514983555555 | 24.303 |
| 4.985574880805555 | 24.292 |
| 4.9886358892222225 | 24.313 |
| 4.991696619833333 | 24.313 |
| 4.994756794861111 | 24.292 |
| 4.997816136527778 | 24.303 |
| 5.0008763115555555 | 24.292 |
| 5.003937875555555 | 24.313 |
| 5.006997217194444 | 24.292 |
| 5.010057947833333 | 24.335 |
| 5.013125067694444 | 24.324 |
| 5.0161860761111114 | 24.303 |
| 5.019249029083333 | 24.292 |
| 5.022308926305556 | 24.313 |
| 5.025374379416666 | 24.303 |
| 5.028433721083333 | 24.281 |
| 5.031496674055556 | 24.292 |
| 5.0345562935 | 24.292 |
| 5.037621468805555 | 24.292 |
| 5.040681366055556 | 24.303 |
| 5.043740707694445 | 24.292 |
| 5.046800049361111 | 24.313 |
| 5.049860779972222 | 24.27 |
| 5.052920954999999 | 24.292 |
| 5.055986408111111 | 24.281 |
| 5.059052416805556 | 24.249 |
| 5.062116203166667 | 24.27 |
| 5.065176933777778 | 24.27 |
| 5.06823822 | 24.26 |
| 5.071298395027777 | 24.249 |
| 5.07435884786111 | 24.249 |
| 5.077421800805555 | 24.26 |
| 5.080485864972222 | 24.249 |
| 5.083547151166666 | 24.249 |
| 5.086607604 | 24.249 |
| 5.089668334611111 | 24.249 |
| 5.092728231861112 | 24.249 |
| 5.095788129083333 | 24.249 |
| 5.098853582194445 | 24.249 |
| 5.101917924138889 | 24.217 |
| 5.104978099166667 | 24.238 |
| 5.108039107583333 | 24.238 |
| 5.111099838194444 | 24.249 |
| 5.114168624833333 | 24.238 |
| 5.117234911333334 | 24.249 |
| 5.120294252972222 | 24.238 |
| 5.123368039888889 | 24.27 |
| 5.126427659333333 | 24.249 |
| 5.129490056722222 | 24.281 |
| 5.132549398388889 | 24.281 |
| 5.135613184722222 | 24.281 |
| 5.138675026527777 | 24.249 |
| 5.1417379795 | 24.238 |
| 5.144797598944444 | 24.249 |
| 5.147858329555556 | 24.249 |
| 5.150919337972223 | 24.249 |
| 5.153978957416666 | 24.27 |
| 5.157038021277778 | 24.26 |
| 5.160102085416667 | 24.27 |
| 5.1631722610277775 | 24.27 |
| 5.166231602666667 | 24.26 |
| 5.169291222111112 | 24.26 |
| 5.172351397138889 | 24.292 |
| 5.1754126833611105 | 24.281 |
| 5.178484247916666 | 24.281 |
| 5.181550256611112 | 24.292 |
| 5.184612376222223 | 24.303 |
| 5.187671717861112 | 24.281 |
| 5.1907313373055555 | 24.281 |
| 5.193790401166667 | 24.303 |
| 5.196854465305556 | 24.292 |
| 5.199921029583333 | 24.281 |
| 5.202983426972223 | 24.292 |
| 5.206043601999999 | 24.292 |
| 5.209104888222223 | 24.292 |
| 5.212165618833334 | 24.292 |
| 5.21523134975 | 24.292 |
| 5.218291246972222 | 24.303 |
| 5.221351699805556 | 24.281 |
| 5.224412430416667 | 24.292 |
| 5.2274720498611105 | 24.292 |
| 5.230532224888889 | 24.303 |
| 5.233592122138889 | 24.303 |
| 5.236652574972222 | 24.303 |
| 5.239729139833334 | 24.303 |
| 5.242792092777777 | 24.303 |
| 5.245856156944444 | 24.281 |
| 5.24892133225 | 24.313 |
| 5.251982062861111 | 24.313 |
| 5.2550433490833335 | 24.313 |
| 5.2581057464444445 | 24.313 |
| 5.2611650881111105 | 24.303 |
| 5.264232207972222 | 24.313 |
| 5.267292383027778 | 24.313 |
| 5.270352002472222 | 24.292 |
| 5.273412455277778 | 24.281 |
| 5.276471796944445 | 24.324 |
| 5.279531416388888 | 24.292 |
| 5.282592980388889 | 24.303 |
| 5.285662878194445 | 24.313 |
| 5.2887374985 | 24.313 |
| 5.291797951333334 | 24.292 |
| 5.294859515333333 | 24.303 |
| 5.297921912694444 | 24.281 |
| 5.300982643333334 | 24.292 |
| 5.304042540555555 | 24.292 |
| 5.307110216027778 | 24.303 |
| 5.310170946638889 | 24.313 |
| 5.313231955055555 | 24.27 |
| 5.316296297 | 24.281 |
| 5.319355360833333 | 24.292 |
| 5.322414702500001 | 24.313 |
| 5.325475433111111 | 24.303 |
| 5.328539219472223 | 24.313 |
| 5.331600783472222 | 24.281 |
| 5.334660125111111 | 24.303 |
| 5.337720855750001 | 24.27 |
| 5.34078241975 | 24.281 |
| 5.343845928305555 | 24.303 |
| 5.3469138815555555 | 24.292 |
| 5.349983223777778 | 24.292 |
| 5.353043398805555 | 24.27 |
| 5.356118019111111 | 24.281 |
| 5.35918208325 | 24.281 |
| 5.3622514254722216 | 24.281 |
| 5.365317434166666 | 24.27 |
| 5.3683826095 | 24.26 |
| 5.371441951138889 | 24.249 |
| 5.374501292777778 | 24.249 |
| 5.37756091225 | 24.249 |
| 5.380622198444445 | 24.249 |
| 5.383681817888888 | 24.249 |
| 5.386744770861111 | 24.249 |
| 5.389806612638889 | 24.228 |
| 5.392867343277778 | 24.249 |
| 5.3959286294722215 | 24.26 |
| 5.398990193472223 | 24.249 |
| 5.4020503685 | 24.249 |
| 5.4051119325 | 24.238 |
| 5.4081718297500005 | 24.217 |
| 5.411232560361111 | 24.217 |
| 5.414291902027777 | 24.217 |
| 5.41735179925 | 24.249 |
| 5.420412807666667 | 24.228 |
| 5.423479927555555 | 24.249 |
| 5.426540935944444 | 24.238 |
| 5.429603611138889 | 24.217 |
| 5.432663786166667 | 24.217 |
| 5.43572368338889 | 24.217 |
| 5.438785525194445 | 24.217 |
| 5.441847644777778 | 24.228 |
| 5.444908653194444 | 24.206 |
| 5.447969106027777 | 24.238 |
| 5.451029836638889 | 24.217 |
| 5.454091400638889 | 24.238 |
| 5.457155187000001 | 24.238 |
| 5.460214806444444 | 24.217 |
| 5.463274703666667 | 24.238 |
| 5.466335989888889 | 24.238 |
| 5.469395887111111 | 24.238 |
| 5.472467173888889 | 24.238 |
| 5.475529849083333 | 24.249 |
| 5.4785914130833335 | 24.249 |
| 5.481656032805556 | 24.249 |
| 5.4847167634166665 | 24.249 |
| 5.48777721625 | 24.26 |
| 5.490839891416667 | 24.249 |
| 5.493900622055556 | 24.249 |
| 5.496970797638889 | 24.27 |
| 5.500029861500001 | 24.27 |
| 5.503089480944444 | 24.249 |
| 5.5061552118611115 | 24.26 |
| 5.509222331722222 | 24.26 |
| 5.51229195175 | 24.26 |
| 5.5153551825 | 24.249 |
| 5.518416746500001 | 24.27 |
| 5.521483310805555 | 24.27 |
| 5.524543763611111 | 24.281 |
| 5.527603938638888 | 24.27 |
| 5.530663835888889 | 24.292 |
| 5.533725399888889 | 24.292 |
| 5.536785297138889 | 24.313 |
| 5.53985075025 | 24.292 |
| 5.5429153699722225 | 24.313 |
| 5.545983323222222 | 24.292 |
| 5.549049054138889 | 24.281 |
| 5.55211450725 | 24.292 |
| 5.555173848888889 | 24.292 |
| 5.558235690694444 | 24.292 |
| 5.561295587916667 | 24.281 |
| 5.5643568741388885 | 24.27 |
| 5.567421771666667 | 24.26 |
| 5.570481113305555 | 24.292 |
| 5.573541010555556 | 24.27 |
| 5.576600352194445 | 24.27 |
| 5.579659971638889 | 24.27 |
| 5.582720424472222 | 24.26 |
| 5.5857800439166665 | 24.27 |
| 5.588839385555556 | 24.27 |
| 5.591900116194444 | 24.26 |
| 5.594966402666667 | 24.26 |
| 5.598037411666667 | 24.27 |
| 5.601097308888889 | 24.27 |
| 5.604161650833333 | 24.292 |
| 5.607221270277778 | 24.281 |
| 5.610287834555556 | 24.281 |
| 5.613353009888889 | 24.292 |
| 5.616419851972222 | 24.27 |
| 5.619479193611111 | 24.292 |
| 5.622542702166666 | 24.303 |
| 5.625603710583333 | 24.292 |
| 5.628668885888889 | 24.281 |
| 5.631730449888889 | 24.292 |
| 5.634794514055556 | 24.303 |
| 5.637856911416667 | 24.303 |
| 5.6409165308611104 | 24.292 |
| 5.643975872527777 | 24.292 |
| 5.647052437388889 | 24.313 |
| 5.65011705711111 | 24.281 |
| 5.653176398749999 | 24.303 |
| 5.656240185111111 | 24.281 |
| 5.65929952675 | 24.281 |
| 5.662359424 | 24.292 |
| 5.665419876833333 | 24.281 |
| 5.668488107888888 | 24.303 |
| 5.671548005111111 | 24.313 |
| 5.6746106802777785 | 24.292 |
| 5.677672244277778 | 24.281 |
| 5.680731585944445 | 24.292 |
| 5.683796483472222 | 24.27 |
| 5.686858325249999 | 24.281 |
| 5.6899182225 | 24.281 |
| 5.6929775641388884 | 24.27 |
| 5.696037461388889 | 24.281 |
| 5.6990979142222224 | 24.281 |
| 5.702159756 | 24.281 |
| 5.705221875583333 | 24.27 |
| 5.708282328416667 | 24.27 |
| 5.711351392861111 | 24.27 |
| 5.7144112900833335 | 24.26 |
| 5.7174722985 | 24.26 |
| 5.720531640138889 | 24.249 |
| 5.723597926638889 | 24.26 |
| 5.726657268305556 | 24.27 |
| 5.7297174433333335 | 24.27 |
| 5.732777896138889 | 24.27 |
| 5.7358427936666665 | 24.26 |
| 5.7389110247222215 | 24.27 |
| 5.741970921972222 | 24.249 |
| 5.745031097 | 24.249 |
| 5.7481026615555555 | 24.228 |
| 5.751162003222222 | 24.26 |
| 5.754223844999999 | 24.249 |
| 5.7572865201944445 | 24.238 |
| 5.760346973 | 24.238 |
| 5.763406314666667 | 24.249 |
| 5.766470101 | 24.281 |
| 5.769530831638889 | 24.249 |
| 5.772593784611112 | 24.27 |
| 5.775661460055555 | 24.292 |
| 5.778723579638888 | 24.249 |
| 5.781783199083334 | 24.27 |
| 5.784851152361111 | 24.249 |
| 5.787911049583333 | 24.249 |
| 5.790970669027778 | 24.27 |
| 5.794030010694445 | 24.281 |
| 5.797092408055556 | 24.281 |
| 5.800152305305556 | 24.26 |
| 5.803216091666666 | 24.292 |
| 5.806275433305555 | 24.281 |
| 5.8093367195 | 24.27 |
| 5.812402172611112 | 24.292 |
| 5.815463736611111 | 24.292 |
| 5.818524745027778 | 24.281 |
| 5.821590475944444 | 24.292 |
| 5.824649539805556 | 24.292 |
| 5.827711937166667 | 24.281 |
| 5.830772945583334 | 24.292 |
| 5.833833953999999 | 24.292 |
| 5.836895240222223 | 24.292 |
| 5.8399554152499995 | 24.303 |
| 5.843014756888889 | 24.281 |
| 5.846076320888889 | 24.281 |
| 5.849135384749999 | 24.292 |
| 5.852196670972223 | 24.281 |
| 5.85527823611111 | 24.303 |
| 5.8583895251666664 | 24.281 |
| 5.861494424972221 | 24.281 |
| 5.865041572305556 | 24.26 |
| 5.868103691888889 | 24.303 |
| 5.871199146722223 | 24.27 |
| 5.8742645998333325 | 24.281 |
| 5.877326441638889 | 24.27 |
| 5.880390505777777 | 24.27 |
| 5.883451236388889 | 24.27 |
| 5.886515300527778 | 24.281 |
| 5.889579920277777 | 24.303 |
| 5.892641206472222 | 24.27 |
| 5.895702492694444 | 24.292 |
| 5.898774057250001 | 24.313 |
| 5.901842566111111 | 24.281 |
| 5.904904130111111 | 24.303 |
| 5.907971249972222 | 24.303 |
| 5.911033091777778 | 24.281 |
| 5.914097155916667 | 24.303 |
| 5.917157886527778 | 24.281 |
| 5.920250007833333 | 24.303 |
| 5.923311294027777 | 24.27 |
| 5.926372580250001 | 24.292 |
| 5.929435255416666 | 24.27 |
| 5.932495152666667 | 24.281 |
| 5.935556161083333 | 24.281 |
| 5.938646893416666 | 24.26 |
| 5.9417173468055555 | 24.249 |
| 5.944780021972222 | 24.27 |
| 5.9478396414166665 | 24.281 |
| 5.950902872194445 | 24.281 |
| 5.953968880888889 | 24.26 |
| 5.957035167388889 | 24.26 |
| 5.960096453583334 | 24.26 |
| 5.963157462 | 24.249 |
| 5.966216803638889 | 24.217 |
| 5.9692775342777775 | 24.26 |
| 5.972344098555556 | 24.228 |
| 5.975404829166667 | 24.238 |
| 5.978468337722222 | 24.249 |
| 5.981530179527778 | 24.249 |
| 5.984600632916667 | 24.228 |
| 5.987664697055555 | 24.249 |
| 5.990725149888888 | 24.249 |
| 5.993791714166667 | 24.249 |
| 5.996862723166667 | 24.249 |
| 5.999927342888888 | 24.249 |
| 6.00298640675 | 24.249 |
| 6.006046859583333 | 24.238 |
| 6.009110923722222 | 24.26 |
| 6.012194988999999 | 24.249 |
| 6.015262942250001 | 24.217 |
| 6.018324784055555 | 24.238 |
| 6.0213857924722225 | 24.238 |
| 6.024445689694445 | 24.249 |
| 6.027506142527778 | 24.238 |
| 6.030568539916667 | 24.238 |
| 6.0336303816944445 | 24.228 |
| 6.036690001138889 | 24.249 |
| 6.039751009555555 | 24.217 |
| 6.042836463833333 | 24.26 |
| 6.045907472805555 | 24.249 |
| 6.048974037083333 | 24.26 |
| 6.05203337875 | 24.27 |
| 6.055093275972222 | 24.249 |
| 6.058152895416667 | 24.26 |
| 6.061213070472222 | 24.26 |
| 6.064274078861112 | 24.27 |
| 6.067334253916667 | 24.27 |
| 6.070394151138889 | 24.27 |
| 6.073453215 | 24.27 |
| 6.076517834722222 | 24.281 |
| 6.079578565361111 | 24.292 |
| 6.082640684944445 | 24.292 |
| 6.085706138055556 | 24.27 |
| 6.088771035583333 | 24.27 |
| 6.091831766194445 | 24.27 |
| 6.094896663722222 | 24.26 |
| 6.097961005666667 | 24.281 |
| 6.101028125527778 | 24.27 |
| 6.104091356277777 | 24.27 |
| 6.107150697944445 | 24.292 |
| 6.110214484277778 | 24.281 |
| 6.113276881666666 | 24.281 |
| 6.1163428903611115 | 24.27 |
| 6.119403898777778 | 24.313 |
| 6.122511020944445 | 24.313 |
| 6.12558341888889 | 24.313 |
| 6.128643871722223 | 24.313 |
| 6.13170404675 | 24.313 |
| 6.1347767225 | 24.313 |
| 6.137839953277778 | 24.313 |
| 6.140899294916666 | 24.313 |
| 6.143959192166667 | 24.324 |
| 6.147031034527778 | 24.335 |
| 6.150090376166666 | 24.324 |
| 6.153151384583333 | 24.313 |
| 6.156232671944444 | 24.292 |
| 6.159293402555556 | 24.303 |
| 6.1623566333055555 | 24.303 |
| 6.165418752916667 | 24.292 |
| 6.168479205722222 | 24.313 |
| 6.1715388251666665 | 24.313 |
| 6.174599000194444 | 24.303 |
| 6.1776655645 | 24.313 |
| 6.180726572916667 | 24.313 |
| 6.183788970277778 | 24.313 |
| 6.186851089888889 | 24.303 |
| 6.189911542694444 | 24.313 |
| 6.192972273333334 | 24.281 |
| 6.196037448638889 | 24.313 |
| 6.199097623666667 | 24.324 |
| 6.202160854444444 | 24.313 |
| 6.205223529611111 | 24.313 |
| 6.208287593750001 | 24.335 |
| 6.211349435555555 | 24.324 |
| 6.214413221888889 | 24.313 |
| 6.217477841638889 | 24.313 |
| 6.220548572805556 | 24.324 |
| 6.223623193111111 | 24.303 |
| 6.226683368138889 | 24.313 |
| 6.229745209944444 | 24.313 |
| 6.232851498722223 | 24.313 |
| 6.235925007861111 | 24.303 |
| 6.239037130305556 | 24.313 |
| 6.242104250166667 | 24.281 |
| 6.245166091972223 | 24.27 |
| 6.248225433611111 | 24.281 |
| 6.251285886444445 | 24.281 |
| 6.2543468948611105 | 24.27 |
| 6.257411236805556 | 24.281 |
| 6.260473634166667 | 24.281 |
| 6.2635426986111105 | 24.303 |
| 6.266602595833334 | 24.281 |
| 6.269662215277777 | 24.303 |
| 6.272726557222223 | 24.303 |
| 6.275786454472222 | 24.313 |
| 6.278846907277778 | 24.292 |
| 6.281907915694444 | 24.292 |
| 6.2849753133611115 | 24.303 |
| 6.288035488416667 | 24.313 |
| 6.2910951078611115 | 24.27 |
| 6.294157227444445 | 24.313 |
| 6.29721768025 | 24.303 |
| 6.300277855305556 | 24.303 |
| 6.30334080825 | 24.281 |
| 6.306401261083333 | 24.281 |
| 6.309463658472222 | 24.281 |
| 6.3125266114444445 | 24.313 |
| 6.315586230888888 | 24.27 |
| 6.3186541841388895 | 24.292 |
| 6.321715470333333 | 24.281 |
| 6.32477647875 | 24.27 |
| 6.327839153944444 | 24.27 |
| 6.330920996861111 | 24.26 |
| 6.333980338527778 | 24.26 |
| 6.3370446804444445 | 24.26 |
| 6.340107911222223 | 24.27 |
| 6.343172253166666 | 24.26 |
| 6.346233817166667 | 24.26 |
| 6.3492951033611105 | 24.238 |
| 6.352355833972222 | 24.238 |
| 6.355422398277778 | 24.26 |
| 6.358483128888889 | 24.249 |
| 6.36154691525 | 24.238 |
| 6.364615701861111 | 24.249 |
| 6.367679766027778 | 24.249 |
| 6.37075633088889 | 24.26 |
| 6.373816783694445 | 24.238 |
| 6.376878903277778 | 24.249 |
| 6.379942689638889 | 24.26 |
| 6.383006753777777 | 24.249 |
| 6.3860663732222225 | 24.26 |
| 6.389140715722222 | 24.281 |
| 6.392206168861111 | 24.27 |
| 6.395265788305556 | 24.26 |
| 6.398325963333334 | 24.292 |
| 6.401385582777778 | 24.27 |
| 6.404447424555555 | 24.281 |
| 6.407507321805555 | 24.313 |
| 6.4105672190277785 | 24.303 |
| 6.413627394083334 | 24.27 |
| 6.416687291305555 | 24.313 |
| 6.419748299722222 | 24.292 |
| 6.422807919166667 | 24.292 |
| 6.425871427722223 | 24.303 |
| 6.4289310471666665 | 24.292 |
| 6.431995389111111 | 24.292 |
| 6.435057786500001 | 24.313 |
| 6.438122961805556 | 24.292 |
| 6.441184525805555 | 24.303 |
| 6.444254145833333 | 24.303 |
| 6.447337655527778 | 24.303 |
| 6.450399775111111 | 24.324 |
| 6.453461894694445 | 24.303 |
| 6.4565237365 | 24.281 |
| 6.459588634027778 | 24.324 |
| 6.462649920222223 | 24.292 |
| 6.465716762305556 | 24.292 |
| 6.468777215138889 | 24.303 |
| 6.471840723694444 | 24.313 |
| 6.474900065333333 | 24.292 |
| 6.477963296083333 | 24.313 |
| 6.481023193333334 | 24.313 |
| 6.484083368361111 | 24.313 |
| 6.487142987805555 | 24.313 |
| 6.490203996222222 | 24.324 |
| 6.493274171833334 | 24.303 |
| 6.496333235694444 | 24.324 |
| 6.499392577333333 | 24.313 |
| 6.502461363972222 | 24.313 |
| 6.505521261222222 | 24.324 |
| 6.508588103277778 | 24.313 |
| 6.511661334638889 | 24.303 |
| 6.514743177555556 | 24.303 |
| 6.517803630388889 | 24.281 |
| 6.520866305555555 | 24.292 |
| 6.523927036194444 | 24.281 |
| 6.526989433555555 | 24.27 |
| 6.530049053000001 | 24.27 |
| 6.53311283936111 | 24.26 |
| 6.536183848333334 | 24.249 |
| 6.539244856750001 | 24.281 |
| 6.542305031777778 | 24.27 |
| 6.545371318277778 | 24.26 |
| 6.548431493305555 | 24.27 |
| 6.551503057888889 | 24.27 |
| 6.554564066305556 | 24.249 |
| 6.557626463666667 | 24.27 |
| 6.560686360916666 | 24.281 |
| 6.56374681375 | 24.26 |
| 6.566807266583333 | 24.249 |
| 6.5698704973333335 | 24.26 |
| 6.572933172500001 | 24.27 |
| 6.575999181194445 | 24.249 |
| 6.5790632453611115 | 24.292 |
| 6.582123142583333 | 24.27 |
| 6.585187206722222 | 24.27 |
| 6.5882521042499995 | 24.292 |
| 6.591318112944444 | 24.27 |
| 6.594378288 | 24.26 |
| 6.597453463888889 | 24.26 |
| 6.600513083333333 | 24.27 |
| 6.603574369527778 | 24.292 |
| 6.606635100138889 | 24.27 |
| 6.609694997388889 | 24.281 |
| 6.612760728277777 | 24.27 |
| 6.615821181111111 | 24.27 |
| 6.618883856305556 | 24.26 |
| 6.621958476583334 | 24.281 |
| 6.62501781825 | 24.26 |
| 6.628077715472222 | 24.26 |
| 6.631140390666667 | 24.27 |
| 6.634206399361111 | 24.281 |
| 6.6372679633611105 | 24.249 |
| 6.640328416194444 | 24.27 |
| 6.643387757833333 | 24.27 |
| 6.646463211527778 | 24.249 |
| 6.649526442277778 | 24.27 |
| 6.652586061722222 | 24.27 |
| 6.655645403388888 | 24.249 |
| 6.658709745305555 | 24.249 |
| 6.661772142694445 | 24.292 |
| 6.66485315225 | 24.27 |
| 6.667913882861111 | 24.27 |
| 6.670974057916666 | 24.27 |
| 6.674033399555555 | 24.27 |
| 6.677093296805555 | 24.27 |
| 6.680153194027778 | 24.281 |
| 6.683216980388889 | 24.26 |
| 6.686281044527777 | 24.26 |
| 6.68934094175 | 24.249 |
| 6.692408061638889 | 24.249 |
| 6.695478237250001 | 24.228 |
| 6.698538967861111 | 24.238 |
| 6.701601643027778 | 24.249 |
| 6.704662651444445 | 24.228 |
| 6.707726715583334 | 24.228 |
| 6.710788001805556 | 24.249 |
| 6.713850399166667 | 24.26 |
| 6.716910574222222 | 24.249 |
| 6.719971860416667 | 24.249 |
| 6.723032868833333 | 24.249 |
| 6.726093043861112 | 24.249 |
| 6.729157108000001 | 24.26 |
| 6.73222089436111 | 24.249 |
| 6.7352807915833335 | 24.26 |
| 6.738342355583333 | 24.249 |
| 6.741402808416666 | 24.27 |
| 6.744462150083334 | 24.249 |
| 6.747542881833333 | 24.26 |
| 6.750602501277778 | 24.26 |
| 6.753665732027778 | 24.27 |
| 6.756728685000001 | 24.27 |
| 6.759788304444444 | 24.27 |
| 6.762853201972223 | 24.27 |
| 6.765915599361111 | 24.27 |
| 6.7689779967499994 | 24.27 |
| 6.77203956075 | 24.281 |
| 6.775101958111111 | 24.281 |
| 6.77816268875 | 24.27 |
| 6.781222030388889 | 24.303 |
| 6.7842830388055555 | 24.27 |
| 6.787345158388889 | 24.281 |
| 6.7904058890000005 | 24.26 |
| 6.7934652306666665 | 24.27 |
| 6.796539017583333 | 24.27 |
| 6.799599192611111 | 24.26 |
| 6.8026610344166665 | 24.26 |
| 6.805720653861111 | 24.27 |
| 6.808781384472223 | 24.27 |
| 6.8118421150833335 | 24.26 |
| 6.814904512472222 | 24.27 |
| 6.8179677432500005 | 24.26 |
| 6.821030418416667 | 24.26 |
| 6.824098649472223 | 24.249 |
| 6.8271588245 | 24.238 |
| 6.830218999527777 | 24.26 |
| 6.833282785888889 | 24.238 |
| 6.836342127527778 | 24.238 |
| 6.839407580638889 | 24.238 |
| 6.8424680334722225 | 24.249 |
| 6.8455309864444445 | 24.249 |
| 6.848601717611111 | 24.238 |
| 6.8516621704444445 | 24.249 |
| 6.854721512111111 | 24.249 |
| 6.857782242722223 | 24.249 |
| 6.860841306583334 | 24.27 |
| 6.863901203805556 | 24.249 |
| 6.866963045611111 | 24.27 |
| 6.870023220638888 | 24.26 |
| 6.873090618305556 | 24.27 |
| 6.876156071416666 | 24.281 |
| 6.879224858055556 | 24.27 |
| 6.8822858664722215 | 24.292 |
| 6.885351041777779 | 24.27 |
| 6.888411494611112 | 24.27 |
| 6.891476947722222 | 24.26 |
| 6.894538511722223 | 24.303 |
| 6.897598131166667 | 24.27 |
| 6.900658861777777 | 24.303 |
| 6.903718203444444 | 24.27 |
| 6.906777267305555 | 24.27 |
| 6.90983688675 | 24.27 |
| 6.912898172944444 | 24.27 |
| 6.915969737527778 | 24.249 |
| 6.919031023722223 | 24.249 |
| 6.9220942545 | 24.26 |
| 6.925154429527778 | 24.27 |
| 6.92821432675 | 24.27 |
| 6.931273668416666 | 24.26 |
| 6.934339954916667 | 24.27 |
| 6.937402630083333 | 24.249 |
| 6.940463082916666 | 24.26 |
| 6.943523257944444 | 24.26 |
| 6.9465914889722225 | 24.249 |
| 6.949660275611111 | 24.249 |
| 6.952726562111111 | 24.27 |
| 6.9557889595 | 24.27 |
| 6.958848578944444 | 24.27 |
| 6.961911254111111 | 24.27 |
| 6.964970873555556 | 24.26 |
| 6.968030770805555 | 24.249 |
| 6.971093168166666 | 24.27 |
| 6.974153898805556 | 24.26 |
| 6.977217129555555 | 24.249 |
| 6.980293416638888 | 24.27 |
| 6.983355536222222 | 24.249 |
| 6.9864184891944445 | 24.26 |
| 6.989481719944444 | 24.228 |
| 6.992548562027777 | 24.238 |
| 6.9956095704444445 | 24.26 |
| 6.998674467972222 | 24.217 |
| 7.001735754166667 | 24.238 |
| 7.004795651416667 | 24.217 |
| 7.007856104222222 | 24.217 |
| 7.010915723666667 | 24.249 |
| 7.0139770098888885 | 24.26 |
| 7.0170377405 | 24.238 |
| 7.020097082166667 | 24.238 |
| 7.023158646166666 | 24.249 |
| 7.026218265611112 | 24.228 |
| 7.029280107388889 | 24.26 |
| 7.03235194975 | 24.249 |
| 7.0354137915555555 | 24.26 |
| 7.038474244388889 | 24.228 |
| 7.041533308222222 | 24.238 |
| 7.044593483277778 | 24.217 |
| 7.047654491666667 | 24.217 |
| 7.0507149445 | 24.238 |
| 7.053776786305556 | 24.217 |
| 7.0568452951388885 | 24.228 |
| 7.059907136944444 | 24.249 |
| 7.062970367694445 | 24.249 |
| 7.066033876250001 | 24.27 |
| 7.069097384805556 | 24.238 |
| 7.072158115416666 | 24.26 |
| 7.075225235305556 | 24.27 |
| 7.078286243722222 | 24.26 |
| 7.081354196972223 | 24.27 |
| 7.084413260833334 | 24.281 |
| 7.0874731580555554 | 24.281 |
| 7.090533610888889 | 24.292 |
| 7.093599619583333 | 24.313 |
| 7.096659239027778 | 24.281 |
| 7.099723025388888 | 24.292 |
| 7.102785422777778 | 24.27 |
| 7.105849209111111 | 24.292 |
| 7.108909384138888 | 24.292 |
| 7.111968725805555 | 24.281 |
| 7.115028900833333 | 24.292 |
| 7.11808990925 | 24.292 |
| 7.121151473249999 | 24.324 |
| 7.1242113704722225 | 24.324 |
| 7.127271545527778 | 24.313 |
| 7.130364500194444 | 24.303 |
| 7.133429953305555 | 24.324 |
| 7.136489294972222 | 24.324 |
| 7.139550581166667 | 24.335 |
| 7.142609645027778 | 24.313 |
| 7.145669542277778 | 24.324 |
| 7.148738606694445 | 24.335 |
| 7.151804337611111 | 24.313 |
| 7.15486367925 | 24.335 |
| 7.157925243249999 | 24.345 |
| 7.160988474 | 24.335 |
| 7.164048093444444 | 24.324 |
| 7.16710993525 | 24.345 |
| 7.1701737216111106 | 24.335 |
| 7.173233896638889 | 24.335 |
| 7.1762960162222225 | 24.356 |
| 7.179359802583334 | 24.324 |
| 7.182421088777778 | 24.313 |
| 7.185483763944444 | 24.335 |
| 7.1885469947222225 | 24.335 |
| 7.191608280916667 | 24.335 |
| 7.194668178166666 | 24.345 |
| 7.197730575527777 | 24.335 |
| 7.200790750583333 | 24.335 |
| 7.203851759 | 24.324 |
| 7.206913878583333 | 24.335 |
| 7.209975164777777 | 24.324 |
| 7.21303561761111 | 24.335 |
| 7.216099403944445 | 24.313 |
| 7.2191590233888885 | 24.313 |
| 7.222219754027778 | 24.345 |
| 7.225279373472222 | 24.313 |
| 7.228342604222222 | 24.313 |
| 7.231405001611112 | 24.313 |
| 7.234464621055555 | 24.335 |
| 7.237526462833334 | 24.324 |
| 7.24058747125 | 24.335 |
| 7.243647924083334 | 24.313 |
| 7.246710043666666 | 24.303 |
| 7.249771052083333 | 24.292 |
| 7.252834560638889 | 24.313 |
| 7.255898902583334 | 24.281 |
| 7.258959911 | 24.313 |
| 7.262021197194445 | 24.303 |
| 7.265093595138889 | 24.313 |
| 7.2681529368055555 | 24.313 |
| 7.27121255625 | 24.313 |
| 7.2742724535 | 24.303 |
| 7.277331795138889 | 24.292 |
| 7.280392247972222 | 24.281 |
| 7.28345408975 | 24.27 |
| 7.286513431416667 | 24.27 |
| 7.289575551 | 24.27 |
| 7.29263878175 | 24.26 |
| 7.295698401194445 | 24.26 |
| 7.298763298722222 | 24.27 |
| 7.301828474055555 | 24.27 |
| 7.304888926861111 | 24.26 |
| 7.3079488241111115 | 24.303 |
| 7.311008999138889 | 24.281 |
| 7.314068340805556 | 24.26 |
| 7.317128515833334 | 24.27 |
| 7.320188968638889 | 24.281 |
| 7.3232496992777785 | 24.292 |
| 7.3263115410555555 | 24.27 |
| 7.329372271694445 | 24.281 |
| 7.332432168916666 | 24.281 |
| 7.335492899527778 | 24.281 |
| 7.338556963694445 | 24.292 |
| 7.341616860916666 | 24.292 |
| 7.344678424916667 | 24.292 |
| 7.347741100083333 | 24.281 |
| 7.350805997611111 | 24.303 |
| 7.353865894861111 | 24.292 |
| 7.3569605163055565 | 24.303 |
| 7.360022635888889 | 24.303 |
| 7.363090033555555 | 24.303 |
| 7.366150208583333 | 24.292 |
| 7.3692151061111115 | 24.303 |
| 7.372274725555555 | 24.27 |
| 7.375339067500001 | 24.303 |
| 7.378400909305555 | 24.303 |
| 7.381478029749999 | 24.313 |
| 7.384538482555556 | 24.313 |
| 7.3876019911111115 | 24.324 |
| 7.390661610555555 | 24.313 |
| 7.393723174555555 | 24.313 |
| 7.396782794 | 24.313 |
| 7.399852969611111 | 24.313 |
| 7.402914255833334 | 24.335 |
| 7.405976931 | 24.335 |
| 7.409036272638889 | 24.313 |
| 7.4121017257499995 | 24.324 |
| 7.415162456388889 | 24.313 |
| 7.418224575972222 | 24.335 |
| 7.421286973333333 | 24.345 |
| 7.424346592805556 | 24.324 |
| 7.427405934444445 | 24.324 |
| 7.430468054027777 | 24.345 |
| 7.433529062444444 | 24.345 |
| 7.43659090425 | 24.335 |
| 7.439651079277778 | 24.356 |
| 7.442712643277778 | 24.345 |
| 7.445785041222222 | 24.335 |
| 7.448844938472222 | 24.335 |
| 7.451907613638888 | 24.324 |
| 7.454967788666666 | 24.303 |
| 7.458027408111111 | 24.335 |
| 7.461088972111111 | 24.303 |
| 7.464150536111111 | 24.281 |
| 7.467216544805555 | 24.313 |
| 7.470277275444444 | 24.292 |
| 7.473339395027778 | 24.303 |
| 7.476402625777778 | 24.292 |
| 7.479461967444444 | 24.281 |
| 7.4825235314444445 | 24.281 |
| 7.485582873083333 | 24.27 |
| 7.488648326194444 | 24.26 |
| 7.491711834749999 | 24.249 |
| 7.4947728431666665 | 24.27 |
| 7.497836073916666 | 24.26 |
| 7.500897915722223 | 24.249 |
| 7.503958368555556 | 24.26 |
| 7.507019932555556 | 24.249 |
| 7.510079274194444 | 24.238 |
| 7.513138893638889 | 24.228 |
| 7.516199346472222 | 24.249 |
| 7.519262299444445 | 24.249 |
| 7.522322196666666 | 24.249 |
| 7.5253818161111115 | 24.238 |
| 7.528441157777778 | 24.249 |
| 7.5315057775 | 24.249 |
| 7.534569008277778 | 24.228 |
| 7.537628627722222 | 24.249 |
| 7.540688247166666 | 24.238 |
| 7.543748144388889 | 24.217 |
| 7.546808041638888 | 24.228 |
| 7.549869883416667 | 24.206 |
| 7.552935892111111 | 24.238 |
| 7.55599662275 | 24.217 |
| 7.559061798055556 | 24.217 |
| 7.5621211397222226 | 24.217 |
| 7.565182148111111 | 24.228 |
| 7.568245378888889 | 24.238 |
| 7.571308609638889 | 24.217 |
| 7.574367951305556 | 24.238 |
| 7.577431182055555 | 24.206 |
| 7.58049469061111 | 24.206 |
| 7.583554865638889 | 24.206 |
| 7.586615040694444 | 24.206 |
| 7.589689660972222 | 24.206 |
| 7.592750113805556 | 24.206 |
| 7.5958108444166665 | 24.206 |
| 7.59887601975 | 24.196 |
| 7.601935639194445 | 24.206 |
| 7.604996092027778 | 24.206 |
| 7.608057100444444 | 24.185 |
| 7.611117831055555 | 24.196 |
| 7.614180784027778 | 24.196 |
| 7.617240403472222 | 24.228 |
| 7.620305300999999 | 24.217 |
| 7.623367976166667 | 24.228 |
| 7.626427873388889 | 24.228 |
| 7.629494715472222 | 24.228 |
| 7.632559613 | 24.228 |
| 7.635623399361111 | 24.217 |
| 7.638684129972223 | 24.217 |
| 7.641745138388888 | 24.249 |
| 7.644810313694445 | 24.206 |
| 7.6478718776944445 | 24.228 |
| 7.65093205275 | 24.228 |
| 7.654001117166667 | 24.228 |
| 7.657070459388889 | 24.228 |
| 7.660130912222222 | 24.228 |
| 7.663196087527777 | 24.228 |
| 7.666255984777778 | 24.228 |
| 7.66931893775 | 24.238 |
| 7.672378279388889 | 24.228 |
| 7.675437621055556 | 24.228 |
| 7.678497518277777 | 24.238 |
| 7.6815607490555555 | 24.238 |
| 7.684620646277778 | 24.249 |
| 7.687679987944445 | 24.249 |
| 7.690739885166667 | 24.249 |
| 7.693799782416666 | 24.27 |
| 7.696862457583333 | 24.26 |
| 7.699930410833333 | 24.27 |
| 7.702990030277777 | 24.27 |
| 7.7060510386944445 | 24.27 |
| 7.709114269472222 | 24.292 |
| 7.712181944916667 | 24.27 |
| 7.715242397750001 | 24.292 |
| 7.718304239527778 | 24.27 |
| 7.721364136777778 | 24.292 |
| 7.724431256666667 | 24.292 |
| 7.727495598583333 | 24.303 |
| 7.730554662444445 | 24.303 |
| 7.733619004388888 | 24.303 |
| 7.736681679555556 | 24.303 |
| 7.739745743694445 | 24.281 |
| 7.742806474333333 | 24.313 |
| 7.745866371555556 | 24.313 |
| 7.748929046722223 | 24.303 |
| 7.751988388388889 | 24.313 |
| 7.755047730027778 | 24.324 |
| 7.7581137387500005 | 24.313 |
| 7.76117863625 | 24.313 |
| 7.76426714625 | 24.335 |
| 7.767328432444445 | 24.313 |
| 7.770388885277778 | 24.292 |
| 7.773449893694444 | 24.313 |
| 7.776513957833333 | 24.324 |
| 7.779575799638889 | 24.324 |
| 7.782636252444445 | 24.324 |
| 7.785696983083333 | 24.313 |
| 7.78875965825 | 24.324 |
| 7.791822889 | 24.324 |
| 7.794883341833333 | 24.324 |
| 7.797944628055555 | 24.313 |
| 7.80100591425 | 24.313 |
| 7.804066367083334 | 24.313 |
| 7.807130431222222 | 24.313 |
| 7.810191161833333 | 24.324 |
| 7.813256059361112 | 24.313 |
| 7.816322068055555 | 24.313 |
| 7.819382798694445 | 24.324 |
| 7.822444640472222 | 24.324 |
| 7.825507315638889 | 24.292 |
| 7.828567212888888 | 24.313 |
| 7.8316265545277775 | 24.303 |
| 7.8346958967499996 | 24.313 |
| 7.837755516194444 | 24.303 |
| 7.840815969027778 | 24.292 |
| 7.843875310694445 | 24.324 |
| 7.846936596888889 | 24.303 |
| 7.849999272055555 | 24.335 |
| 7.853064447388888 | 24.292 |
| 7.8561243446111115 | 24.313 |
| 7.8591836862777775 | 24.324 |
| 7.862247472611111 | 24.313 |
| 7.865310981166666 | 24.303 |
| 7.8683753231111115 | 24.313 |
| 7.871438276083333 | 24.303 |
| 7.874497895527778 | 24.292 |
| 7.877556959388889 | 24.313 |
| 7.880625468222222 | 24.27 |
| 7.883685365472222 | 24.292 |
| 7.886750540777777 | 24.27 |
| 7.889848773555556 | 24.27 |
| 7.892909781972222 | 24.281 |
| 7.895974123888889 | 24.281 |
| 7.899037632444444 | 24.281 |
| 7.9020978075 | 24.281 |
| 7.905157149138889 | 24.303 |
| 7.908219268722222 | 24.281 |
| 7.911279165972222 | 24.303 |
| 7.914353786277777 | 24.292 |
| 7.917414794666667 | 24.281 |
| 7.920474969722222 | 24.313 |
| 7.923553479138889 | 24.292 |
| 7.926625599277778 | 24.281 |
| 7.929690496805556 | 24.281 |
| 7.932769006222222 | 24.281 |
| 7.935828903472222 | 24.27 |
| 7.938890467472222 | 24.27 |
| 7.941953698222222 | 24.27 |
| 7.945014706638888 | 24.281 |
| 7.948084604444445 | 24.292 |
| 7.951148946388889 | 24.27 |
| 7.954216621833334 | 24.26 |
| 7.9572809637777775 | 24.249 |
| 7.960340027638889 | 24.27 |
| 7.963402980611112 | 24.249 |
| 7.9664637112222225 | 24.249 |
| 7.969524719638889 | 24.249 |
| 7.9726101738888895 | 24.26 |
| 7.975673404666667 | 24.249 |
| 7.978733857472222 | 24.26 |
| 7.981794865888889 | 24.249 |
| 7.984856707694445 | 24.26 |
| 7.98792021625 | 24.27 |
| 7.990984558194444 | 24.27 |
| 7.994045011000001 | 24.27 |
| 7.997111019722222 | 24.249 |
| 8.000172583722222 | 24.281 |
| 8.003232480944444 | 24.281 |
| 8.006292378194445 | 24.281 |
| 8.009358109083333 | 24.292 |
| 8.01241828411111 | 24.292 |
| 8.015482626055556 | 24.292 |
| 8.01854780138889 | 24.313 |
| 8.02161019875 | 24.313 |
| 8.02467231836111 | 24.313 |
| 8.02773166 | 24.303 |
| 8.030807113694445 | 24.303 |
| 8.033866455333333 | 24.292 |
| 8.036930241694444 | 24.292 |
| 8.039990416722222 | 24.324 |
| 8.043063925833334 | 24.313 |
| 8.046123545277778 | 24.303 |
| 8.049185942666666 | 24.303 |
| 8.052253340333333 | 24.303 |
| 8.055313237583333 | 24.313 |
| 8.058374246 | 24.313 |
| 8.061436365583333 | 24.313 |
| 8.064497651777778 | 24.313 |
| 8.067558382388889 | 24.313 |
| 8.070627446833333 | 24.292 |
| 8.073695677888889 | 24.292 |
| 8.076759742027777 | 24.303 |
| 8.079827417472222 | 24.313 |
| 8.082888981472223 | 24.281 |
| 8.085961935027777 | 24.313 |
| 8.089026554750001 | 24.313 |
| 8.092085896416666 | 24.313 |
| 8.095147182611111 | 24.303 |
| 8.09820958 | 24.313 |
| 8.101268921638889 | 24.313 |
| 8.10432881888889 | 24.335 |
| 8.107392605222222 | 24.303 |
| 8.110452502472222 | 24.313 |
| 8.113515733222222 | 24.324 |
| 8.116575908277778 | 24.313 |
| 8.119643028138888 | 24.324 |
| 8.122710148 | 24.313 |
| 8.125770878638889 | 24.324 |
| 8.12883244263889 | 24.313 |
| 8.131893451055555 | 24.324 |
| 8.134952792694444 | 24.313 |
| 8.138012689944444 | 24.313 |
| 8.141073420555555 | 24.313 |
| 8.14413304 | 24.313 |
| 8.147195159583333 | 24.335 |
| 8.15025450125 | 24.324 |
| 8.153318009805556 | 24.303 |
| 8.156385407472222 | 24.324 |
| 8.159446138083332 | 24.324 |
| 8.16250631311111 | 24.313 |
| 8.16556565475 | 24.281 |
| 8.168624996416666 | 24.313 |
| 8.171685171444445 | 24.335 |
| 8.174750902361112 | 24.313 |
| 8.177815799888888 | 24.292 |
| 8.180885975472222 | 24.303 |
| 8.183948928444444 | 24.303 |
| 8.187011603611111 | 24.303 |
| 8.190073445416667 | 24.303 |
| 8.193138898527778 | 24.281 |
| 8.196201573694443 | 24.303 |
| 8.199261470944444 | 24.292 |
| 8.202323034944444 | 24.281 |
| 8.205395432888889 | 24.281 |
| 8.208458108083333 | 24.27 |
| 8.211517171916666 | 24.27 |
| 8.21457845813889 | 24.27 |
| 8.217637522 | 24.27 |
| 8.220697419222223 | 24.26 |
| 8.223762038972222 | 24.249 |
| 8.226822491777778 | 24.27 |
| 8.229889889444443 | 24.249 |
| 8.2329581205 | 24.27 |
| 8.236021073472223 | 24.27 |
| 8.239080970722222 | 24.281 |
| 8.242140867944444 | 24.281 |
| 8.245200487388889 | 24.27 |
| 8.248261218 | 24.249 |
| 8.25133000463889 | 24.26 |
| 8.254394624388889 | 24.26 |
| 8.257457577361112 | 24.27 |
| 8.260520252527778 | 24.27 |
| 8.263583761083334 | 24.249 |
| 8.266645325083333 | 24.217 |
| 8.269710778194444 | 24.26 |
| 8.272771786611111 | 24.228 |
| 8.275833906194444 | 24.238 |
| 8.278893525638889 | 24.238 |
| 8.281952867277777 | 24.228 |
| 8.28501193113889 | 24.238 |
| 8.288073217361111 | 24.249 |
| 8.291132836805556 | 24.249 |
| 8.294193567416666 | 24.249 |
| 8.297254853611111 | 24.249 |
| 8.300314195277778 | 24.249 |
| 8.303379648388889 | 24.238 |
| 8.306439267833333 | 24.238 |
| 8.309498887277778 | 24.27 |
| 8.312559617888889 | 24.249 |
| 8.315618959555556 | 24.26 |
| 8.318678301194446 | 24.26 |
| 8.32174180975 | 24.27 |
| 8.324808374027779 | 24.26 |
| 8.32786966025 | 24.26 |
| 8.33093983586111 | 24.26 |
| 8.333998899694445 | 24.26 |
| 8.337059908111112 | 24.26 |
| 8.340123416666666 | 24.249 |
| 8.343182480527778 | 24.27 |
| 8.346247378055555 | 24.249 |
| 8.3493069975 | 24.27 |
| 8.352368839305555 | 24.27 |
| 8.355428736527779 | 24.27 |
| 8.358488355972222 | 24.249 |
| 8.361557698194446 | 24.249 |
| 8.36462120675 | 24.238 |
| 8.367682492972222 | 24.26 |
| 8.370742112416666 | 24.238 |
| 8.373803120833333 | 24.249 |
| 8.376863295861112 | 24.249 |
| 8.379923193083332 | 24.249 |
| 8.3829842015 | 24.26 |
| 8.386046043305555 | 24.249 |
| 8.389109829638889 | 24.217 |
| 8.392169449083333 | 24.249 |
| 8.395229901916666 | 24.249 |
| 8.398289243583333 | 24.27 |
| 8.401351363166667 | 24.249 |
| 8.404415982888889 | 24.26 |
| 8.407482824972222 | 24.238 |
| 8.410542166611112 | 24.26 |
| 8.413601508277777 | 24.238 |
| 8.416662516694444 | 24.249 |
| 8.419721858333334 | 24.249 |
| 8.422783977916668 | 24.26 |
| 8.425844152944444 | 24.26 |
| 8.4289076615 | 24.238 |
| 8.431968392138888 | 24.238 |
| 8.4350307895 | 24.238 |
| 8.438091797916666 | 24.26 |
| 8.441166696027778 | 24.238 |
| 8.444230760166667 | 24.249 |
| 8.447290935194445 | 24.249 |
| 8.450351388027778 | 24.249 |
| 8.453412952027778 | 24.249 |
| 8.456473960444445 | 24.249 |
| 8.4595408025 | 24.228 |
| 8.462600977555555 | 24.238 |
| 8.465660319194445 | 24.228 |
| 8.468720494222222 | 24.196 |
| 8.471780113666666 | 24.206 |
| 8.474847233555556 | 24.217 |
| 8.477910186527778 | 24.196 |
| 8.480975361833334 | 24.185 |
| 8.484039425972222 | 24.196 |
| 8.48710043438889 | 24.206 |
| 8.490160331638888 | 24.206 |
| 8.493220506666667 | 24.185 |
| 8.496286515361112 | 24.196 |
| 8.4993505795 | 24.185 |
| 8.50241131011111 | 24.185 |
| 8.505472318527778 | 24.196 |
| 8.508533882527777 | 24.163 |
| 8.511594890944444 | 24.153 |
| 8.51465506597222 | 24.185 |
| 8.517715518805556 | 24.174 |
| 8.520777082805555 | 24.185 |
| 8.523837257833334 | 24.174 |
| 8.526899655222222 | 24.174 |
| 8.529967608472221 | 24.185 |
| 8.533032228194445 | 24.185 |
| 8.536092681027778 | 24.185 |
| 8.539153411638889 | 24.185 |
| 8.542213864472222 | 24.185 |
| 8.545275706277778 | 24.174 |
| 8.548337270277777 | 24.174 |
| 8.551409668222222 | 24.196 |
| 8.554473732361112 | 24.174 |
| 8.557533351805555 | 24.174 |
| 8.56060324961111 | 24.174 |
| 8.563669813916666 | 24.174 |
| 8.566729155555555 | 24.174 |
| 8.569790719555556 | 24.163 |
| 8.572850616805555 | 24.185 |
| 8.575912736388888 | 24.174 |
| 8.578975133777778 | 24.185 |
| 8.582041142472223 | 24.163 |
| 8.585104651027777 | 24.163 |
| 8.58816538163889 | 24.174 |
| 8.591230279166668 | 24.174 |
| 8.594292954333334 | 24.163 |
| 8.59735618511111 | 24.185 |
| 8.600416082333334 | 24.174 |
| 8.603475979583333 | 24.185 |
| 8.606546432972221 | 24.163 |
| 8.609606330222222 | 24.163 |
| 8.612666783027779 | 24.185 |
| 8.615729736 | 24.174 |
| 8.618788799861111 | 24.174 |
| 8.621850086083333 | 24.185 |
| 8.624913872416666 | 24.185 |
| 8.62797432525 | 24.196 |
| 8.631036167055555 | 24.185 |
| 8.634095508694443 | 24.196 |
| 8.637155961527778 | 24.174 |
| 8.640220025666666 | 24.196 |
| 8.64328686775 | 24.206 |
| 8.646351765277778 | 24.196 |
| 8.649412218083334 | 24.185 |
| 8.6524826715 | 24.206 |
| 8.65554201313889 | 24.185 |
| 8.658606355083334 | 24.185 |
| 8.66166653011111 | 24.163 |
| 8.66472642736111 | 24.185 |
| 8.667792436055556 | 24.153 |
| 8.670852333277777 | 24.174 |
| 8.673911952722221 | 24.174 |
| 8.676971572166668 | 24.206 |
| 8.680033136166667 | 24.196 |
| 8.683093033416666 | 24.206 |
| 8.68615598638889 | 24.196 |
| 8.689216994805555 | 24.217 |
| 8.692287448194444 | 24.238 |
| 8.695349012194445 | 24.217 |
| 8.698415576472222 | 24.238 |
| 8.701479362833334 | 24.217 |
| 8.704539815666667 | 24.249 |
| 8.707599990694444 | 24.228 |
| 8.710660165722222 | 24.238 |
| 8.713743675416668 | 24.238 |
| 8.716808295138888 | 24.26 |
| 8.719868192388889 | 24.26 |
| 8.722927534027777 | 24.26 |
| 8.725987153472222 | 24.26 |
| 8.729052884388889 | 24.249 |
| 8.732111948250001 | 24.249 |
| 8.735172678861112 | 24.27 |
| 8.738234520666667 | 24.26 |
| 8.741299695972222 | 24.249 |
| 8.744358759833334 | 24.281 |
| 8.74742365736111 | 24.26 |
| 8.750484110194444 | 24.26 |
| 8.753556785944443 | 24.228 |
| 8.756618349944445 | 24.238 |
| 8.759686580972222 | 24.238 |
| 8.762745644833334 | 24.249 |
| 8.7658130425 | 24.238 |
| 8.76887293975 | 24.249 |
| 8.77194255975 | 24.238 |
| 8.775003568166667 | 24.217 |
| 8.778062909833334 | 24.217 |
| 8.781124751611111 | 24.217 |
| 8.784191315916667 | 24.217 |
| 8.7872534355 | 24.217 |
| 8.790322499916668 | 24.217 |
| 8.793381841583333 | 24.228 |
| 8.796443127777778 | 24.228 |
| 8.799503025027777 | 24.228 |
| 8.802567089166667 | 24.238 |
| 8.80562920875 | 24.238 |
| 8.808699939944445 | 24.217 |
| 8.811763170694444 | 24.217 |
| 8.81487029286111 | 24.228 |
| 8.817929912305555 | 24.217 |
| 8.820991476305554 | 24.217 |
| 8.82405192913889 | 24.217 |
| 8.827114604305555 | 24.238 |
| 8.830175057138888 | 24.249 |
| 8.833243565972221 | 24.238 |
| 8.836305129972223 | 24.217 |
| 8.839380861444445 | 24.238 |
| 8.84244048088889 | 24.238 |
| 8.845502878277777 | 24.249 |
| 8.848570275944445 | 24.249 |
| 8.851629339805555 | 24.238 |
| 8.854697015277777 | 24.249 |
| 8.85776385736111 | 24.238 |
| 8.860823754583333 | 24.238 |
| 8.863887263138889 | 24.249 |
| 8.866948827138888 | 24.238 |
| 8.870012057916668 | 24.249 |
| 8.873071399555554 | 24.249 |
| 8.876131574583333 | 24.249 |
| 8.879191194027777 | 24.249 |
| 8.88225164686111 | 24.249 |
| 8.8853109885 | 24.26 |
| 8.888371441333334 | 24.249 |
| 8.891431338583333 | 24.249 |
| 8.894497625055555 | 24.249 |
| 8.897580023583334 | 24.249 |
| 8.900654088305556 | 24.238 |
| 8.90371370775 | 24.228 |
| 8.906773327194445 | 24.228 |
| 8.90983683575 | 24.228 |
| 8.912899510916667 | 24.228 |
| 8.915961352722222 | 24.217 |
| 8.919022638916667 | 24.217 |
| 8.922081980583334 | 24.196 |
| 8.925145766916666 | 24.196 |
| 8.928206497555555 | 24.196 |
| 8.931268617138889 | 24.196 |
| 8.934329069972222 | 24.206 |
| 8.937389522777778 | 24.206 |
| 8.940449975611111 | 24.206 |
| 8.943509595055556 | 24.217 |
| 8.946572548027778 | 24.217 |
| 8.949646334944445 | 24.185 |
| 8.952723455388888 | 24.206 |
| 8.955783908222221 | 24.206 |
| 8.958844916638888 | 24.206 |
| 8.961908425194444 | 24.217 |
| 8.964967766833333 | 24.228 |
| 8.968032664361111 | 24.217 |
| 8.971096450722222 | 24.238 |
| 8.974159681472221 | 24.206 |
| 8.977220967694445 | 24.228 |
| 8.980287531972222 | 24.228 |
| 8.983349651555555 | 24.238 |
| 8.986410659972222 | 24.228 |
| 8.989470279416667 | 24.228 |
| 8.992531565611111 | 24.238 |
| 8.995594796388888 | 24.228 |
| 8.998654693611112 | 24.238 |
| 9.001714868638889 | 24.228 |
| 9.004775321472222 | 24.217 |
| 9.007834940916666 | 24.228 |
| 9.010900116250001 | 24.228 |
| 9.013961124666666 | 24.217 |
| 9.017022688666668 | 24.249 |
| 9.02008230811111 | 24.249 |
| 9.023146094444444 | 24.26 |
| 9.026206547277777 | 24.26 |
| 9.029270611416667 | 24.26 |
| 9.032331619833334 | 24.249 |
| 9.035394017222222 | 24.26 |
| 9.03845335886111 | 24.249 |
| 9.041517978583334 | 24.249 |
| 9.04457815363889 | 24.27 |
| 9.047656107444444 | 24.26 |
| 9.050720171583333 | 24.238 |
| 9.053779791027779 | 24.249 |
| 9.056840799444444 | 24.26 |
| 9.059904863583334 | 24.27 |
| 9.062966427583333 | 24.281 |
| 9.066026047027778 | 24.27 |
| 9.069087611027777 | 24.27 |
| 9.072149175055555 | 24.249 |
| 9.075209627861112 | 24.26 |
| 9.078272303055556 | 24.26 |
| 9.081333033666667 | 24.249 |
| 9.084400986916668 | 24.238 |
| 9.087464217666668 | 24.238 |
| 9.090537449 | 24.238 |
| 9.093604846666667 | 24.228 |
| 9.09666752186111 | 24.249 |
| 9.099727141305555 | 24.217 |
| 9.102793427805556 | 24.249 |
| 9.105853047250001 | 24.228 |
| 9.108913222277778 | 24.228 |
| 9.1119731195 | 24.238 |
| 9.115033294527779 | 24.217 |
| 9.118097914277778 | 24.217 |
| 9.121161978416666 | 24.217 |
| 9.124222153444446 | 24.185 |
| 9.127289273333334 | 24.206 |
| 9.130352781888888 | 24.196 |
| 9.13341434588889 | 24.174 |
| 9.136478687805557 | 24.196 |
| 9.139539140638888 | 24.217 |
| 9.142601260222222 | 24.206 |
| 9.14567115802778 | 24.206 |
| 9.148732999833333 | 24.196 |
| 9.151800953083333 | 24.217 |
| 9.154861405916666 | 24.217 |
| 9.157921025361112 | 24.217 |
| 9.16098342275 | 24.217 |
| 9.164042764388888 | 24.238 |
| 9.16710266163889 | 24.217 |
| 9.17016200327778 | 24.228 |
| 9.173221622722222 | 24.196 |
| 9.176284853472223 | 24.217 |
| 9.179349195416668 | 24.217 |
| 9.182409926027779 | 24.185 |
| 9.185469267694446 | 24.185 |
| 9.188529164916666 | 24.196 |
| 9.191589617750001 | 24.206 |
| 9.194651459555555 | 24.217 |
| 9.197726913222223 | 24.196 |
| 9.200786532666667 | 24.228 |
| 9.203851430194446 | 24.217 |
| 9.206912438611111 | 24.196 |
| 9.209972613638888 | 24.217 |
| 9.213032788666666 | 24.238 |
| 9.21609407488889 | 24.217 |
| 9.219156472277778 | 24.217 |
| 9.222216647305556 | 24.217 |
| 9.225279600277778 | 24.217 |
| 9.228345608972223 | 24.217 |
| 9.231411895472222 | 24.228 |
| 9.234473459472223 | 24.217 |
| 9.237533078916666 | 24.217 |
| 9.240595754083333 | 24.206 |
| 9.243654817944444 | 24.196 |
| 9.246714159583332 | 24.206 |
| 9.249782668416668 | 24.196 |
| 9.252842010083334 | 24.238 |
| 9.255904963055556 | 24.228 |
| 9.258967638222222 | 24.26 |
| 9.26202781325 | 24.249 |
| 9.265097711055557 | 24.217 |
| 9.268162330805556 | 24.228 |
| 9.271228895083334 | 24.238 |
| 9.274292125833332 | 24.249 |
| 9.277358134555556 | 24.249 |
| 9.280434699416668 | 24.249 |
| 9.283496541194443 | 24.228 |
| 9.286558383000001 | 24.249 |
| 9.289618280222223 | 24.217 |
| 9.292677899666668 | 24.217 |
| 9.295741963805556 | 24.228 |
| 9.298801861055555 | 24.217 |
| 9.301863980638888 | 24.238 |
| 9.30492554463889 | 24.238 |
| 9.307985719666668 | 24.238 |
| 9.311057562055556 | 24.206 |
| 9.314118570444446 | 24.228 |
| 9.317179856666666 | 24.228 |
| 9.320239476111112 | 24.249 |
| 9.323307984944444 | 24.238 |
| 9.326372882472223 | 24.249 |
| 9.329432501916665 | 24.238 |
| 9.332502121944446 | 24.249 |
| 9.335563408138889 | 24.26 |
| 9.338626083305556 | 24.26 |
| 9.341693203194446 | 24.249 |
| 9.344752822638888 | 24.26 |
| 9.347815497805556 | 24.27 |
| 9.350875395055555 | 24.26 |
| 9.353943626083334 | 24.238 |
| 9.357006579055556 | 24.238 |
| 9.360070087611112 | 24.26 |
| 9.363133318388888 | 24.27 |
| 9.366195160166667 | 24.26 |
| 9.369254501833334 | 24.27 |
| 9.372315232444445 | 24.238 |
| 9.375377074249998 | 24.27 |
| 9.378439749416666 | 24.26 |
| 9.381509369444444 | 24.26 |
| 9.384569266666666 | 24.249 |
| 9.38763055288889 | 24.27 |
| 9.39069850613889 | 24.249 |
| 9.393760347916666 | 24.26 |
| 9.396820522972222 | 24.238 |
| 9.399880697999999 | 24.249 |
| 9.402940039638889 | 24.249 |
| 9.405999659083335 | 24.249 |
| 9.409062889861112 | 24.238 |
| 9.412122787083334 | 24.249 |
| 9.41518629563889 | 24.238 |
| 9.418246192888889 | 24.249 |
| 9.421308868055556 | 24.249 |
| 9.4243684875 | 24.249 |
| 9.427430329305555 | 24.249 |
| 9.430489948750001 | 24.27 |
| 9.433554012888889 | 24.238 |
| 9.436614743500002 | 24.228 |
| 9.439675751916667 | 24.238 |
| 9.442736482527778 | 24.238 |
| 9.445795824194445 | 24.26 |
| 9.448859610527776 | 24.217 |
| 9.451927008194444 | 24.228 |
| 9.454987738833333 | 24.238 |
| 9.458068192777777 | 24.206 |
| 9.461128090027778 | 24.217 |
| 9.46418854286111 | 24.185 |
| 9.467252606999999 | 24.185 |
| 9.470319726861112 | 24.196 |
| 9.473379068527779 | 24.196 |
| 9.4764420215 | 24.217 |
| 9.479501363138889 | 24.196 |
| 9.48256431611111 | 24.206 |
| 9.485623935555555 | 24.206 |
| 9.488686610722223 | 24.206 |
| 9.491751230472223 | 24.206 |
| 9.494810572111112 | 24.217 |
| 9.497871580527777 | 24.206 |
| 9.500949256555556 | 24.196 |
| 9.504008875999999 | 24.228 |
| 9.507074051333333 | 24.26 |
| 9.5101367265 | 24.217 |
| 9.51320384636111 | 24.217 |
| 9.516264299194445 | 24.238 |
| 9.51932530761111 | 24.217 |
| 9.52238464925 | 24.217 |
| 9.52544371311111 | 24.228 |
| 9.528513055333333 | 24.217 |
| 9.531578786250002 | 24.196 |
| 9.534645628333335 | 24.217 |
| 9.537708303499999 | 24.196 |
| 9.540777367916666 | 24.196 |
| 9.543839765305556 | 24.206 |
| 9.546898829166668 | 24.228 |
| 9.549958448611111 | 24.185 |
| 9.553017790277778 | 24.196 |
| 9.55608657688889 | 24.185 |
| 9.559147307527779 | 24.196 |
| 9.562207482555555 | 24.196 |
| 9.565268490972223 | 24.217 |
| 9.568330332750001 | 24.206 |
| 9.571391341166667 | 24.196 |
| 9.574454294138889 | 24.196 |
| 9.577513635777777 | 24.185 |
| 9.580577144333333 | 24.174 |
| 9.583642041861111 | 24.196 |
| 9.586701383527778 | 24.196 |
| 9.589762391944445 | 24.196 |
| 9.592823122555556 | 24.196 |
| 9.595885519944444 | 24.228 |
| 9.598948472916666 | 24.228 |
| 9.602011425861111 | 24.217 |
| 9.605072989861112 | 24.238 |
| 9.608137331805557 | 24.228 |
| 9.611198895805556 | 24.238 |
| 9.614260459805555 | 24.228 |
| 9.617319523666668 | 24.228 |
| 9.620378865333334 | 24.217 |
| 9.623443485055555 | 24.228 |
| 9.626503382277777 | 24.238 |
| 9.6295646685 | 24.228 |
| 9.632630677194445 | 24.249 |
| 9.635690018833332 | 24.26 |
| 9.638757138722223 | 24.217 |
| 9.64181731375 | 24.217 |
| 9.644881933472222 | 24.238 |
| 9.647943497472223 | 24.249 |
| 9.651003394722222 | 24.217 |
| 9.654063291972221 | 24.217 |
| 9.657123189194444 | 24.238 |
| 9.660183642027778 | 24.238 |
| 9.663244928222221 | 24.249 |
| 9.666307881194445 | 24.249 |
| 9.669367778444444 | 24.249 |
| 9.67242739788889 | 24.26 |
| 9.675493128777777 | 24.249 |
| 9.678555526166665 | 24.249 |
| 9.681626812944444 | 24.26 |
| 9.68468865475 | 24.281 |
| 9.687753830055556 | 24.27 |
| 9.690817060833334 | 24.27 |
| 9.693891403333334 | 24.303 |
| 9.696951022777778 | 24.292 |
| 9.700014253527778 | 24.292 |
| 9.703080540027777 | 24.303 |
| 9.706184328666668 | 24.27 |
| 9.70925756 | 24.281 |
| 9.71231690163889 | 24.27 |
| 9.71537985461111 | 24.292 |
| 9.71843975186111 | 24.281 |
| 9.721505760555555 | 24.281 |
| 9.724569546916666 | 24.281 |
| 9.727633055472221 | 24.292 |
| 9.730693508277778 | 24.292 |
| 9.733762572722222 | 24.26 |
| 9.736824970111112 | 24.27 |
| 9.739887923055555 | 24.26 |
| 9.7429475425 | 24.281 |
| 9.746007717555555 | 24.27 |
| 9.749068170361111 | 24.238 |
| 9.752136401416667 | 24.26 |
| 9.755197409833333 | 24.27 |
| 9.758267863222223 | 24.303 |
| 9.761328038250001 | 24.281 |
| 9.764405992083333 | 24.249 |
| 9.7674670005 | 24.26 |
| 9.770528842305556 | 24.27 |
| 9.77359735113889 | 24.27 |
| 9.776691139194446 | 24.249 |
| 9.779754369972222 | 24.228 |
| 9.782814544999999 | 24.238 |
| 9.78587472002778 | 24.217 |
| 9.788942117694443 | 24.249 |
| 9.792013960055556 | 24.196 |
| 9.795076357444444 | 24.217 |
| 9.798147088638888 | 24.196 |
| 9.80121004161111 | 24.206 |
| 9.80428994 | 24.206 |
| 9.807369560583334 | 24.217 |
| 9.810429180027779 | 24.196 |
| 9.81348991063889 | 24.206 |
| 9.81655064125 | 24.217 |
| 9.81963665111111 | 24.228 |
| 9.822698770694444 | 24.217 |
| 9.825758667916666 | 24.217 |
| 9.828819120750001 | 24.228 |
| 9.831879295777778 | 24.217 |
| 9.834941693166666 | 24.217 |
| 9.838002146000001 | 24.217 |
| 9.841070654833333 | 24.217 |
| 9.844130829861111 | 24.217 |
| 9.847202394444444 | 24.249 |
| 9.850267291972221 | 24.238 |
| 9.853326911416667 | 24.238 |
| 9.85639069775 | 24.217 |
| 9.859452817333333 | 24.238 |
| 9.8625168815 | 24.217 |
| 9.865577889888888 | 24.228 |
| 9.868638342722223 | 24.217 |
| 9.871702684666666 | 24.228 |
| 9.87476397086111 | 24.217 |
| 9.877823590305555 | 24.228 |
| 9.88088376536111 | 24.217 |
| 9.883950329638889 | 24.238 |
| 9.887010782472222 | 24.228 |
| 9.890089291861111 | 24.217 |
| 9.893148911305556 | 24.228 |
| 9.89620991972222 | 24.217 |
| 9.899269816972222 | 24.217 |
| 9.902329992 | 24.196 |
| 9.905389333666667 | 24.228 |
| 9.908449786472223 | 24.206 |
| 9.911522184444445 | 24.217 |
| 9.914583192833332 | 24.249 |
| 9.91764892375 | 24.228 |
| 9.920710765555555 | 24.228 |
| 9.92377205175 | 24.217 |
| 9.926835004722221 | 24.228 |
| 9.929901569 | 24.217 |
| 9.93297646711111 | 24.217 |
| 9.93604053125 | 24.217 |
| 9.939100706277777 | 24.228 |
| 9.942170604083332 | 24.217 |
| 9.945233001472223 | 24.217 |
| 9.948292065333334 | 24.206 |
| 9.951353351527779 | 24.26 |
| 9.954415193333334 | 24.217 |
| 9.957512592722223 | 24.217 |
| 9.960576656861111 | 24.249 |
| 9.963641276583335 | 24.249 |
| 9.966701729416666 | 24.228 |
| 9.969764126777779 | 24.249 |
| 9.972826246388887 | 24.249 |
| 9.9758916995 | 24.249 |
| 9.978952152305556 | 24.27 |
| 9.982013438527778 | 24.249 |
| 9.985073891361111 | 24.249 |
| 9.988136566527778 | 24.249 |
| 9.991213686972221 | 24.228 |
| 9.994276917722223 | 24.238 |
| 9.99733764836111 | 24.238 |
| 10.000403934833333 | 24.249 |
| 10.003467165611111 | 24.27 |
| 10.00652734063889 | 24.228 |
| 10.00958723788889 | 24.238 |
| 10.012652135388889 | 24.249 |
| 10.015713977194444 | 24.228 |
| 10.018774430027777 | 24.27 |
| 10.021844605611111 | 24.249 |
| 10.02490533625 | 24.27 |
| 10.027965511277777 | 24.249 |
| 10.031028186444445 | 24.27 |
| 10.034088639277778 | 24.27 |
| 10.037161037222223 | 24.281 |
| 10.040220934472222 | 24.27 |
| 10.04328027611111 | 24.27 |
| 10.046339895555555 | 24.292 |
| 10.04940340411111 | 24.292 |
| 10.052466634888889 | 24.27 |
| 10.055530976805555 | 24.27 |
| 10.05859142963889 | 24.292 |
| 10.061651604666666 | 24.292 |
| 10.064712613083332 | 24.27 |
| 10.067771954749999 | 24.292 |
| 10.070831851972223 | 24.27 |
| 10.073893415972222 | 24.27 |
| 10.076953590999999 | 24.27 |
| 10.08001821075 | 24.27 |
| 10.083078107972224 | 24.281 |
| 10.086140227555555 | 24.27 |
| 10.089200402611112 | 24.26 |
| 10.092263633361112 | 24.249 |
| 10.095323808388889 | 24.281 |
| 10.098399262083333 | 24.238 |
| 10.101463326222222 | 24.27 |
| 10.104524056833332 | 24.27 |
| 10.107583120694445 | 24.249 |
| 10.110642184555555 | 24.27 |
| 10.113710137805556 | 24.228 |
| 10.116770312833333 | 24.217 |
| 10.119830210083334 | 24.228 |
| 10.12289371863889 | 24.217 |
| 10.12596472761111 | 24.206 |
| 10.129024624861112 | 24.206 |
| 10.132093689277777 | 24.196 |
| 10.135155253277777 | 24.206 |
| 10.138214872722221 | 24.206 |
| 10.141277547916665 | 24.196 |
| 10.14434216763889 | 24.196 |
| 10.14740206488889 | 24.196 |
| 10.15046196211111 | 24.206 |
| 10.15352213713889 | 24.217 |
| 10.156582589972222 | 24.228 |
| 10.159644153972222 | 24.206 |
| 10.162704051222223 | 24.228 |
| 10.165770893305556 | 24.217 |
| 10.1688321795 | 24.228 |
| 10.171891243361111 | 24.238 |
| 10.174961418972222 | 24.238 |
| 10.178021316194444 | 24.249 |
| 10.181086491527777 | 24.27 |
| 10.18414638875 | 24.249 |
| 10.187207397166667 | 24.27 |
| 10.190270072333332 | 24.26 |
| 10.193330247388888 | 24.249 |
| 10.196394033722223 | 24.27 |
| 10.19945337538889 | 24.27 |
| 10.202517439527778 | 24.249 |
| 10.20557900352778 | 24.27 |
| 10.208639178555556 | 24.26 |
| 10.211699631388887 | 24.281 |
| 10.214763417722223 | 24.249 |
| 10.217824148333333 | 24.26 |
| 10.220885990138887 | 24.249 |
| 10.223945331777777 | 24.238 |
| 10.227006617999999 | 24.238 |
| 10.230067626416666 | 24.26 |
| 10.233130857166666 | 24.249 |
| 10.236192698972223 | 24.249 |
| 10.2392750975 | 24.249 |
| 10.24233443913889 | 24.26 |
| 10.245401003416665 | 24.249 |
| 10.24846117847222 | 24.249 |
| 10.251524131444445 | 24.281 |
| 10.254593195861112 | 24.27 |
| 10.257652815305555 | 24.27 |
| 10.260724657666668 | 24.27 |
| 10.26379066636111 | 24.27 |
| 10.266850563611111 | 24.292 |
| 10.26990990525 | 24.27 |
| 10.272970358083334 | 24.27 |
| 10.276029977527777 | 24.27 |
| 10.27909515286111 | 24.27 |
| 10.282155883472221 | 24.26 |
| 10.285217169666666 | 24.292 |
| 10.288276233527778 | 24.27 |
| 10.291339464305555 | 24.26 |
| 10.294400472694445 | 24.27 |
| 10.29745981436111 | 24.27 |
| 10.300519711583332 | 24.249 |
| 10.303579886638888 | 24.249 |
| 10.3066470065 | 24.26 |
| 10.309706070361111 | 24.281 |
| 10.312772912444444 | 24.27 |
| 10.31583336527778 | 24.281 |
| 10.318892984722222 | 24.292 |
| 10.32195399311111 | 24.281 |
| 10.325035836055557 | 24.313 |
| 10.328095177722222 | 24.313 |
| 10.331157852888888 | 24.303 |
| 10.334223306 | 24.303 |
| 10.337282369861112 | 24.303 |
| 10.3403417115 | 24.281 |
| 10.34340160875 | 24.292 |
| 10.346463450527779 | 24.303 |
| 10.349526681305557 | 24.292 |
| 10.352586578527777 | 24.324 |
| 10.355646197972224 | 24.313 |
| 10.358713873444445 | 24.313 |
| 10.361776270833333 | 24.303 |
| 10.36483727925 | 24.313 |
| 10.367899121027778 | 24.324 |
| 10.370960962833333 | 24.335 |
| 10.374029193888889 | 24.324 |
| 10.377095480361112 | 24.303 |
| 10.380160655694445 | 24.303 |
| 10.383221941888888 | 24.324 |
| 10.3862826725 | 24.303 |
| 10.389345903277778 | 24.313 |
| 10.392407467277778 | 24.324 |
| 10.395467920111113 | 24.303 |
| 10.398528372916667 | 24.313 |
| 10.401587992361112 | 24.313 |
| 10.404648445194445 | 24.303 |
| 10.407707786833333 | 24.292 |
| 10.410769628638889 | 24.281 |
| 10.413829525888888 | 24.27 |
| 10.416889700916666 | 24.313 |
| 10.419949875944443 | 24.303 |
| 10.42300949538889 | 24.281 |
| 10.426070226 | 24.27 |
| 10.429137345888888 | 24.292 |
| 10.4321980765 | 24.281 |
| 10.435257418138889 | 24.281 |
| 10.438320093333333 | 24.281 |
| 10.441383879666667 | 24.27 |
| 10.444446277055556 | 24.26 |
| 10.447509230027778 | 24.26 |
| 10.45056912727778 | 24.249 |
| 10.453630691277779 | 24.26 |
| 10.456700311277778 | 24.249 |
| 10.459772153638887 | 24.27 |
| 10.46283427322222 | 24.27 |
| 10.465897226194445 | 24.249 |
| 10.468959068 | 24.27 |
| 10.472018409638888 | 24.27 |
| 10.47507830688889 | 24.249 |
| 10.478144037805555 | 24.26 |
| 10.481205879583333 | 24.26 |
| 10.484265499027778 | 24.249 |
| 10.487325396277779 | 24.228 |
| 10.490385571305556 | 24.228 |
| 10.493447413083333 | 24.228 |
| 10.496507865916668 | 24.228 |
| 10.49956915213889 | 24.228 |
| 10.50262988275 | 24.217 |
| 10.50568922438889 | 24.249 |
| 10.508749399416667 | 24.217 |
| 10.511815130333334 | 24.217 |
| 10.51488475036111 | 24.217 |
| 10.517946036555555 | 24.217 |
| 10.521007878361111 | 24.196 |
| 10.524067775583333 | 24.206 |
| 10.527127672833334 | 24.196 |
| 10.530187292277777 | 24.196 |
| 10.533248856277776 | 24.185 |
| 10.536309031305557 | 24.196 |
| 10.5393703175 | 24.185 |
| 10.542436603999999 | 24.196 |
| 10.545499556972223 | 24.196 |
| 10.548559732000001 | 24.196 |
| 10.551619073666668 | 24.174 |
| 10.554680915444443 | 24.163 |
| 10.557741646083333 | 24.196 |
| 10.560803765666666 | 24.206 |
| 10.563863385111112 | 24.185 |
| 10.566930227194446 | 24.196 |
| 10.56999068 | 24.185 |
| 10.573057244305556 | 24.185 |
| 10.576118530499999 | 24.196 |
| 10.579177872166666 | 24.206 |
| 10.58223776938889 | 24.196 |
| 10.5852985 | 24.206 |
| 10.588357841666667 | 24.185 |
| 10.591422183611112 | 24.185 |
| 10.594487636722222 | 24.185 |
| 10.597547256166665 | 24.196 |
| 10.60060632 | 24.174 |
| 10.603676217833332 | 24.185 |
| 10.606735559472222 | 24.196 |
| 10.609797401277778 | 24.206 |
| 10.612858409666666 | 24.196 |
| 10.615918862500001 | 24.228 |
| 10.6189804265 | 24.206 |
| 10.62204115713889 | 24.206 |
| 10.625103554499999 | 24.206 |
| 10.628166507472223 | 24.196 |
| 10.631225849138888 | 24.217 |
| 10.634286579749999 | 24.217 |
| 10.637351477277777 | 24.217 |
| 10.640412763472222 | 24.206 |
| 10.643472382916668 | 24.217 |
| 10.646542002944445 | 24.217 |
| 10.649606067083335 | 24.238 |
| 10.652667353277778 | 24.217 |
| 10.655726694944445 | 24.228 |
| 10.65879437038889 | 24.228 |
| 10.661861490277778 | 24.217 |
| 10.664934443805555 | 24.228 |
| 10.668001563694444 | 24.249 |
| 10.671067294583334 | 24.238 |
| 10.674128303 | 24.217 |
| 10.677187644666667 | 24.238 |
| 10.680248097472223 | 24.228 |
| 10.683309105888888 | 24.249 |
| 10.686368447555557 | 24.238 |
| 10.689428067 | 24.26 |
| 10.692489908777778 | 24.249 |
| 10.695549250444445 | 24.26 |
| 10.698616092527779 | 24.27 |
| 10.701675711972223 | 24.27 |
| 10.704736164777778 | 24.27 |
| 10.707806895972222 | 24.26 |
| 10.710868182194444 | 24.27 |
| 10.713928357222223 | 24.238 |
| 10.716988254444445 | 24.249 |
| 10.72004787388889 | 24.249 |
| 10.723108048944445 | 24.26 |
| 10.72616933513889 | 24.249 |
| 10.72922923238889 | 24.249 |
| 10.732293574305556 | 24.249 |
| 10.735352915972223 | 24.228 |
| 10.738412535416666 | 24.228 |
| 10.741472988222222 | 24.249 |
| 10.744532885472221 | 24.249 |
| 10.747602783277777 | 24.238 |
| 10.750665180666665 | 24.228 |
| 10.753728411416667 | 24.228 |
| 10.756794975722222 | 24.249 |
| 10.759857928694444 | 24.238 |
| 10.762923937388889 | 24.238 |
| 10.765988279305557 | 24.26 |
| 10.769065121972222 | 24.281 |
| 10.772129741694444 | 24.249 |
| 10.775193805833332 | 24.249 |
| 10.77825564763889 | 24.27 |
| 10.781319433999998 | 24.26 |
| 10.784378775638888 | 24.281 |
| 10.787438117277777 | 24.292 |
| 10.790498014527778 | 24.281 |
| 10.793559300722222 | 24.27 |
| 10.796619753555555 | 24.27 |
| 10.799679372999998 | 24.27 |
| 10.80273927025 | 24.292 |
| 10.805800000861112 | 24.281 |
| 10.808866287361111 | 24.281 |
| 10.81193757413889 | 24.27 |
| 10.814999693722223 | 24.281 |
| 10.818060424333334 | 24.27 |
| 10.821126433027779 | 24.26 |
| 10.824186330277778 | 24.27 |
| 10.827282340694445 | 24.27 |
| 10.830341682333334 | 24.27 |
| 10.83340269075 | 24.27 |
| 10.836468143861111 | 24.281 |
| 10.839538041666666 | 24.26 |
| 10.84259932788889 | 24.27 |
| 10.845661725277777 | 24.27 |
| 10.848731345277779 | 24.27 |
| 10.85179040913889 | 24.249 |
| 10.854850584166666 | 24.26 |
| 10.857910203611112 | 24.249 |
| 10.860973156583334 | 24.26 |
| 10.864033609416666 | 24.249 |
| 10.867092951055556 | 24.238 |
| 10.870154792861111 | 24.249 |
| 10.873215245694444 | 24.249 |
| 10.876274865138889 | 24.249 |
| 10.879335873555556 | 24.228 |
| 10.882396326361112 | 24.238 |
| 10.885455668027777 | 24.238 |
| 10.88851778761111 | 24.217 |
| 10.89158435188889 | 24.228 |
| 10.8946450825 | 24.228 |
| 10.897715535916666 | 24.228 |
| 10.900782377999999 | 24.228 |
| 10.903842275222223 | 24.228 |
| 10.90690939511111 | 24.228 |
| 10.909970125722221 | 24.228 |
| 10.91302946736111 | 24.217 |
| 10.91609103136111 | 24.238 |
| 10.919152317583332 | 24.238 |
| 10.922213603777777 | 24.238 |
| 10.92527655675 | 24.217 |
| 10.928337842972223 | 24.217 |
| 10.931400240333332 | 24.228 |
| 10.934463748888888 | 24.228 |
| 10.937528646416668 | 24.217 |
| 10.940589654833333 | 24.217 |
| 10.94365233 | 24.228 |
| 10.94671222725 | 24.217 |
| 10.949772402277778 | 24.206 |
| 10.952831743944444 | 24.196 |
| 10.955893585722222 | 24.238 |
| 10.958974317500001 | 24.217 |
| 10.962035048111112 | 24.217 |
| 10.965094667555556 | 24.228 |
| 10.968163176388888 | 24.228 |
| 10.971222795833334 | 24.217 |
| 10.974283526472224 | 24.206 |
| 10.977345090472223 | 24.228 |
| 10.980408599027777 | 24.217 |
| 10.983468218472222 | 24.228 |
| 10.986528115694444 | 24.217 |
| 10.989589124111111 | 24.196 |
| 10.992651521500001 | 24.206 |
| 10.99571086313889 | 24.217 |
| 10.998772704944445 | 24.228 |
| 11.001832602166667 | 24.206 |
| 11.004892221611112 | 24.217 |
| 11.007951841055554 | 24.206 |
| 11.011015071833333 | 24.206 |
| 11.014078302583334 | 24.217 |
| 11.017142366722222 | 24.196 |
| 11.020206986472221 | 24.217 |
| 11.02326799488889 | 24.228 |
| 11.026328169916667 | 24.217 |
| 11.029399734472223 | 24.238 |
| 11.032458798333332 | 24.238 |
| 11.0355214735 | 24.238 |
| 11.03858609325 | 24.228 |
| 11.041648212833334 | 24.238 |
| 11.044709499027778 | 24.249 |
| 11.04777217422222 | 24.249 |
| 11.050832904833333 | 24.249 |
| 11.053894468833334 | 24.249 |
| 11.05695547725 | 24.238 |
| 11.060021208138888 | 24.26 |
| 11.063081383194444 | 24.26 |
| 11.06614489175 | 24.27 |
| 11.069206177944444 | 24.249 |
| 11.072268297527778 | 24.249 |
| 11.075329861527777 | 24.27 |
| 11.078390869944444 | 24.26 |
| 11.081458267611112 | 24.249 |
| 11.084517609277777 | 24.26 |
| 11.087577228722223 | 24.249 |
| 11.090637125944443 | 24.26 |
| 11.093700912305556 | 24.228 |
| 11.096769698944446 | 24.249 |
| 11.099831818527779 | 24.217 |
| 11.102900605166667 | 24.228 |
| 11.105962169166666 | 24.249 |
| 11.109028733444445 | 24.238 |
| 11.112093353166665 | 24.228 |
| 11.115156028361111 | 24.228 |
| 11.118215647805554 | 24.238 |
| 11.121274989444444 | 24.238 |
| 11.12433544227778 | 24.238 |
| 11.127399784194445 | 24.238 |
| 11.130467459666667 | 24.26 |
| 11.133529579249998 | 24.249 |
| 11.136590865472222 | 24.27 |
| 11.13965826313889 | 24.27 |
| 11.142718160361111 | 24.27 |
| 11.145782224500001 | 24.249 |
| 11.148843510722221 | 24.27 |
| 11.15190507472222 | 24.249 |
| 11.154969694444445 | 24.26 |
| 11.158032925222223 | 24.27 |
| 11.161098378333334 | 24.27 |
| 11.16416272025 | 24.292 |
| 11.167223450888889 | 24.27 |
| 11.170291681916666 | 24.26 |
| 11.173353245916665 | 24.26 |
| 11.176420921388889 | 24.27 |
| 11.179481374222222 | 24.26 |
| 11.182542660416667 | 24.27 |
| 11.185608946916666 | 24.27 |
| 11.1886710665 | 24.26 |
| 11.19173013036111 | 24.26 |
| 11.194796139055555 | 24.26 |
| 11.197857147472224 | 24.249 |
| 11.200922322777778 | 24.26 |
| 11.20398194222222 | 24.238 |
| 11.207047395333332 | 24.249 |
| 11.210108125972221 | 24.228 |
| 11.213176634805556 | 24.249 |
| 11.216236532055554 | 24.249 |
| 11.219305318694444 | 24.238 |
| 11.222368549444445 | 24.238 |
| 11.225431502416667 | 24.249 |
| 11.228496955527778 | 24.26 |
| 11.231600744166666 | 24.249 |
| 11.23466036361111 | 24.249 |
| 11.237723872166665 | 24.249 |
| 11.240787102916666 | 24.217 |
| 11.24385616736111 | 24.228 |
| 11.246915786805555 | 24.217 |
| 11.249975128444445 | 24.228 |
| 11.253038081416667 | 24.249 |
| 11.25610575688889 | 24.249 |
| 11.259170098805555 | 24.228 |
| 11.262250552777779 | 24.217 |
| 11.265312672361112 | 24.228 |
| 11.268389237222221 | 24.228 |
| 11.271454412555556 | 24.217 |
| 11.274519310083335 | 24.228 |
| 11.27761143138889 | 24.217 |
| 11.280674384333333 | 24.206 |
| 11.283759005222223 | 24.217 |
| 11.286818902472222 | 24.185 |
| 11.289884355583332 | 24.196 |
| 11.292947308527777 | 24.196 |
| 11.296018039722224 | 24.206 |
| 11.299087104166667 | 24.196 |
| 11.302148112583334 | 24.217 |
| 11.305219954944445 | 24.174 |
| 11.308280129972223 | 24.196 |
| 11.311339749416666 | 24.185 |
| 11.314406313694445 | 24.185 |
| 11.31746593313889 | 24.185 |
| 11.320528052722223 | 24.163 |
| 11.323605450972224 | 24.196 |
| 11.326664792638889 | 24.185 |
| 11.329724967666667 | 24.163 |
| 11.332786809444444 | 24.174 |
| 11.335849206833334 | 24.185 |
| 11.338911882 | 24.174 |
| 11.34197177925 | 24.174 |
| 11.345031676472223 | 24.163 |
| 11.348101574305556 | 24.174 |
| 11.351160915944444 | 24.153 |
| 11.35422109097222 | 24.153 |
| 11.357281543805556 | 24.153 |
| 11.36034116325 | 24.174 |
| 11.363457452611112 | 24.142 |
| 11.366523461305555 | 24.153 |
| 11.369584191916665 | 24.142 |
| 11.372645200333334 | 24.153 |
| 11.37570620875 | 24.142 |
| 11.378769995083335 | 24.142 |
| 11.38183017013889 | 24.142 |
| 11.38489173413889 | 24.121 |
| 11.387951075777778 | 24.131 |
| 11.39101402875 | 24.11 |
| 11.394073648194444 | 24.142 |
| 11.397173825500001 | 24.131 |
| 11.400238723027778 | 24.131 |
| 11.403300287027777 | 24.11 |
| 11.40636073986111 | 24.131 |
| 11.409427859722223 | 24.11 |
| 11.412491646083332 | 24.089 |
| 11.415556265805556 | 24.121 |
| 11.418618385416666 | 24.099 |
| 11.421686338666667 | 24.11 |
| 11.424750680583333 | 24.089 |
| 11.427811688999999 | 24.099 |
| 11.430872141833333 | 24.099 |
| 11.433934261416667 | 24.11 |
| 11.436999714527778 | 24.11 |
| 11.440061278527777 | 24.099 |
| 11.443121175777778 | 24.089 |
| 11.446182184194445 | 24.099 |
| 11.449245970527778 | 24.099 |
| 11.452310590277778 | 24.089 |
| 11.455373543222223 | 24.089 |
| 11.4584495525 | 24.089 |
| 11.461514450027778 | 24.089 |
| 11.464579625361111 | 24.067 |
| 11.467639244805556 | 24.078 |
| 11.470700253194446 | 24.067 |
| 11.473760706027777 | 24.078 |
| 11.476821714444444 | 24.078 |
| 11.479899112694444 | 24.067 |
| 11.482961787861111 | 24.078 |
| 11.486027240972222 | 24.057 |
| 11.489102139055555 | 24.057 |
| 11.49216231411111 | 24.067 |
| 11.495222211333335 | 24.046 |
| 11.49829683163889 | 24.035 |
| 11.501357006666666 | 24.035 |
| 11.50441995963889 | 24.035 |
| 11.507481801444444 | 24.024 |
| 11.510552254833332 | 24.024 |
| 11.513617430138888 | 24.024 |
| 11.516677327388889 | 24.035 |
| 11.519746947416667 | 24.024 |
| 11.522807678027778 | 24.003 |
| 11.525878687 | 24.014 |
| 11.528941084388888 | 24.003 |
| 11.53200014825 | 24.024 |
| 11.53506199002778 | 24.003 |
| 11.538124387416667 | 24.024 |
| 11.541184562444444 | 24.035 |
| 11.544245848666668 | 24.024 |
| 11.547306023694444 | 24.024 |
| 11.550365643138889 | 24.024 |
| 11.553424984777777 | 24.046 |
| 11.55648404863889 | 24.046 |
| 11.559544223666668 | 24.046 |
| 11.562606065472222 | 24.046 |
| 11.56566707388889 | 24.035 |
| 11.568728360083332 | 24.057 |
| 11.571791313055556 | 24.057 |
| 11.5748509325 | 24.046 |
| 11.577914441055556 | 24.067 |
| 11.580977671833335 | 24.046 |
| 11.584036735694445 | 24.046 |
| 11.587104966722222 | 24.067 |
| 11.590166252944444 | 24.067 |
| 11.593231428249998 | 24.067 |
| 11.596292436666667 | 24.067 |
| 11.599352333916666 | 24.067 |
| 11.602414453500002 | 24.067 |
| 11.60547685086111 | 24.089 |
| 11.608536192527778 | 24.089 |
| 11.611595534166668 | 24.078 |
| 11.614657375972222 | 24.11 |
| 11.617717550999998 | 24.078 |
| 11.620778559416667 | 24.089 |
| 11.623838456666666 | 24.131 |
| 11.626899187277777 | 24.121 |
| 11.629963529222223 | 24.121 |
| 11.633024259833334 | 24.131 |
| 11.636084434861111 | 24.142 |
| 11.63915488825 | 24.121 |
| 11.642216730055557 | 24.131 |
| 11.645281905361111 | 24.131 |
| 11.648348469666667 | 24.142 |
| 11.651410311444446 | 24.131 |
| 11.654471597666666 | 24.11 |
| 11.657531772694444 | 24.131 |
| 11.660591114333332 | 24.121 |
| 11.663651567166667 | 24.121 |
| 11.666717020277778 | 24.131 |
| 11.669780251027777 | 24.131 |
| 11.672841815027779 | 24.153 |
| 11.675901156694444 | 24.142 |
| 11.678961609527779 | 24.121 |
| 11.682021228972221 | 24.11 |
| 11.685084459722223 | 24.131 |
| 11.688145468138888 | 24.131 |
| 11.691205365388889 | 24.142 |
| 11.694267207166668 | 24.153 |
| 11.697327937777779 | 24.153 |
| 11.700387279444444 | 24.142 |
| 11.703450788 | 24.131 |
| 11.706510407444444 | 24.142 |
| 11.709589472444444 | 24.131 |
| 11.712650480861111 | 24.142 |
| 11.715711211472222 | 24.163 |
| 11.718770553138889 | 24.131 |
| 11.72183045036111 | 24.142 |
| 11.724900348166665 | 24.142 |
| 11.727966079083334 | 24.131 |
| 11.731028476472222 | 24.163 |
| 11.734093373972222 | 24.153 |
| 11.737153826805557 | 24.142 |
| 11.740216779777779 | 24.153 |
| 11.74328223288889 | 24.163 |
| 11.746343519111111 | 24.153 |
| 11.74940369413889 | 24.153 |
| 11.752464146944444 | 24.163 |
| 11.755523210805556 | 24.174 |
| 11.758583941444446 | 24.185 |
| 11.761648838944444 | 24.163 |
| 11.76470818061111 | 24.163 |
| 11.76776835563889 | 24.163 |
| 11.770832419777777 | 24.185 |
| 11.77389287261111 | 24.196 |
| 11.776953881027778 | 24.185 |
| 11.780017389583334 | 24.163 |
| 11.78308089813889 | 24.153 |
| 11.786145517861112 | 24.153 |
| 11.789205137305556 | 24.174 |
| 11.792264756749999 | 24.153 |
| 11.795328265305555 | 24.174 |
| 11.798391496083333 | 24.163 |
| 11.801454726833333 | 24.174 |
| 11.80451573525 | 24.174 |
| 11.80757646586111 | 24.185 |
| 11.810636918694444 | 24.185 |
| 11.813700982833334 | 24.185 |
| 11.816761435666667 | 24.185 |
| 11.819825221999999 | 24.185 |
| 11.822893730861113 | 24.206 |
| 11.825953628083333 | 24.206 |
| 11.829016303277777 | 24.206 |
| 11.832077589472222 | 24.217 |
| 11.835138597888887 | 24.196 |
| 11.83820071747222 | 24.217 |
| 11.84126394825 | 24.185 |
| 11.844323845472223 | 24.206 |
| 11.847384576083334 | 24.206 |
| 11.85045280713889 | 24.174 |
| 11.853512148805557 | 24.163 |
| 11.856577601916667 | 24.185 |
| 11.859636943555556 | 24.174 |
| 11.862703785638889 | 24.163 |
| 11.865767016388888 | 24.196 |
| 11.868826358055555 | 24.196 |
| 11.8718940335 | 24.185 |
| 11.87495865325 | 24.185 |
| 11.878019106055557 | 24.185 |
| 11.881082059027777 | 24.196 |
| 11.884145845388888 | 24.185 |
| 11.887205187027778 | 24.196 |
| 11.890265362055555 | 24.196 |
| 11.893327481666667 | 24.196 |
| 11.896386823305555 | 24.185 |
| 11.899453109805554 | 24.196 |
| 11.902512451444444 | 24.206 |
| 11.905572626472221 | 24.174 |
| 11.908632523722222 | 24.185 |
| 11.911691865361112 | 24.206 |
| 11.914751207027779 | 24.185 |
| 11.91781499336111 | 24.174 |
| 11.920875168416666 | 24.185 |
| 11.92394145488889 | 24.185 |
| 11.927004407861112 | 24.196 |
| 11.930065138472223 | 24.185 |
| 11.933128091444445 | 24.185 |
| 11.936190211027778 | 24.163 |
| 11.939258164305556 | 24.163 |
| 11.942322228444443 | 24.153 |
| 11.945381292305555 | 24.153 |
| 11.948444800861111 | 24.153 |
| 11.951504698083333 | 24.142 |
| 11.954569595611112 | 24.131 |
| 11.957628937277779 | 24.131 |
| 11.960692445833335 | 24.131 |
| 11.963752065277777 | 24.131 |
| 11.966811684722222 | 24.099 |
| 11.969874082083333 | 24.121 |
| 11.972934534916666 | 24.099 |
| 11.975995543333333 | 24.121 |
| 11.979055162777778 | 24.11 |
| 11.982116726777777 | 24.121 |
| 11.985183291055556 | 24.11 |
| 11.988242632722223 | 24.121 |
| 11.991303085527777 | 24.131 |
| 11.994363260583333 | 24.099 |
| 11.997425380166666 | 24.121 |
| 12.000487777527779 | 24.11 |
| 12.003553508444444 | 24.11 |
| 12.006613961277779 | 24.11 |
| 12.00967941438889 | 24.131 |
| 12.01273931161111 | 24.121 |
| 12.015806153694443 | 24.11 |
| 12.018867717694443 | 24.11 |
| 12.021942893583333 | 24.11 |
| 12.025004179805556 | 24.099 |
| 12.028066577166667 | 24.11 |
| 12.031129530138887 | 24.121 |
| 12.034189427388888 | 24.089 |
| 12.037250713583333 | 24.11 |
| 12.040313110972221 | 24.099 |
| 12.043376897333333 | 24.11 |
| 12.046444294999999 | 24.121 |
| 12.04950502561111 | 24.11 |
| 12.052566867416667 | 24.11 |
| 12.055630653749999 | 24.131 |
| 12.058698329222223 | 24.131 |
| 12.061759059833333 | 24.142 |
| 12.06482479075 | 24.153 |
| 12.067885521361111 | 24.131 |
| 12.070947640944445 | 24.131 |
| 12.074015316416666 | 24.131 |
| 12.077076324833333 | 24.131 |
| 12.080142611305556 | 24.131 |
| 12.083205008694444 | 24.121 |
| 12.086268795055556 | 24.11 |
| 12.089332303611112 | 24.121 |
| 12.092403034805555 | 24.131 |
| 12.095462932027777 | 24.131 |
| 12.098522273694444 | 24.11 |
| 12.101583004305555 | 24.121 |
| 12.10464262375 | 24.121 |
| 12.10770835463889 | 24.11 |
| 12.110769085277779 | 24.131 |
| 12.113851483805556 | 24.131 |
| 12.116910825444446 | 24.153 |
| 12.119976000777777 | 24.142 |
| 12.123040620500001 | 24.142 |
| 12.126106629194446 | 24.142 |
| 12.129166804222223 | 24.131 |
| 12.132227812638888 | 24.131 |
| 12.13528854325 | 24.142 |
| 12.138352885194443 | 24.153 |
| 12.14142111625 | 24.121 |
| 12.144480180111112 | 24.142 |
| 12.14754174411111 | 24.142 |
| 12.150611641916667 | 24.153 |
| 12.15367709502778 | 24.131 |
| 12.156736436666666 | 24.142 |
| 12.15979911186111 | 24.121 |
| 12.162859842472221 | 24.163 |
| 12.165924462194445 | 24.131 |
| 12.169000749277778 | 24.142 |
| 12.172062313277777 | 24.142 |
| 12.175128877555556 | 24.142 |
| 12.178190441555556 | 24.142 |
| 12.181253116722223 | 24.142 |
| 12.18431245838889 | 24.131 |
| 12.187371800027776 | 24.142 |
| 12.190433641833334 | 24.131 |
| 12.193499094944444 | 24.131 |
| 12.196569548333333 | 24.142 |
| 12.199631945722222 | 24.142 |
| 12.202691565166667 | 24.131 |
| 12.205755629305555 | 24.131 |
| 12.208816359916666 | 24.131 |
| 12.211890980222222 | 24.131 |
| 12.214952822027778 | 24.121 |
| 12.218019386305556 | 24.131 |
| 12.221085395 | 24.131 |
| 12.224149459138888 | 24.131 |
| 12.227211300944445 | 24.131 |
| 12.230272031555556 | 24.163 |
| 12.233332206583333 | 24.153 |
| 12.236393215 | 24.163 |
| 12.239457001361112 | 24.121 |
| 12.242518287555557 | 24.153 |
| 12.245578740388888 | 24.142 |
| 12.248638082027778 | 24.131 |
| 12.251698257055555 | 24.131 |
| 12.254763710194444 | 24.142 |
| 12.257823607416666 | 24.131 |
| 12.260883226861111 | 24.142 |
| 12.263947568805555 | 24.131 |
| 12.267009966194445 | 24.131 |
| 12.270069863416667 | 24.131 |
| 12.273131983 | 24.153 |
| 12.276192991416666 | 24.131 |
| 12.27925427763889 | 24.142 |
| 12.28231750838889 | 24.142 |
| 12.285379072388888 | 24.131 |
| 12.288438414027777 | 24.131 |
| 12.291512200972223 | 24.163 |
| 12.294572376 | 24.153 |
| 12.297643662777777 | 24.163 |
| 12.300702726638889 | 24.153 |
| 12.303762346083333 | 24.142 |
| 12.306822243305556 | 24.131 |
| 12.309883251722221 | 24.131 |
| 12.31294259338889 | 24.131 |
| 12.316020269416667 | 24.142 |
| 12.319080444444444 | 24.153 |
| 12.322140619472222 | 24.131 |
| 12.325202183472223 | 24.163 |
| 12.32826541425 | 24.153 |
| 12.331325311472222 | 24.131 |
| 12.334386319888889 | 24.142 |
| 12.337450661833333 | 24.142 |
| 12.34051167025 | 24.131 |
| 12.343580179083332 | 24.11 |
| 12.346642298666666 | 24.131 |
| 12.34970830736111 | 24.142 |
| 12.352767649027777 | 24.142 |
| 12.35583226875 | 24.142 |
| 12.358892999361112 | 24.121 |
| 12.361953452194443 | 24.131 |
| 12.365013349444444 | 24.142 |
| 12.368073246666667 | 24.142 |
| 12.371133421694445 | 24.131 |
| 12.3742033195 | 24.142 |
| 12.377265161305555 | 24.142 |
| 12.380325058555556 | 24.142 |
| 12.383392734000001 | 24.131 |
| 12.386457631527778 | 24.131 |
| 12.389517250972222 | 24.121 |
| 12.392585759805556 | 24.131 |
| 12.395647323805555 | 24.131 |
| 12.398708054444445 | 24.131 |
| 12.401769618444444 | 24.121 |
| 12.404835904916666 | 24.142 |
| 12.407904413777779 | 24.131 |
| 12.410966811166666 | 24.142 |
| 12.414026430611111 | 24.11 |
| 12.417086883416667 | 24.131 |
| 12.42014733625 | 24.131 |
| 12.423210011416666 | 24.131 |
| 12.426269353083333 | 24.121 |
| 12.429334528388889 | 24.131 |
| 12.432394981222222 | 24.11 |
| 12.43545904536111 | 24.131 |
| 12.438519498194445 | 24.131 |
| 12.441579395416667 | 24.121 |
| 12.44464457075 | 24.099 |
| 12.447728080444445 | 24.121 |
| 12.450791033416667 | 24.131 |
| 12.453857597694446 | 24.099 |
| 12.45693471813889 | 24.131 |
| 12.4599985045 | 24.131 |
| 12.46306645775 | 24.11 |
| 12.466129410722221 | 24.121 |
| 12.469192085888888 | 24.131 |
| 12.472254761055556 | 24.11 |
| 12.475326603444444 | 24.11 |
| 12.478389556416666 | 24.121 |
| 12.481451398194444 | 24.121 |
| 12.48451324 | 24.11 |
| 12.487575637361111 | 24.131 |
| 12.490642479444444 | 24.131 |
| 12.493703487861112 | 24.11 |
| 12.496767829805556 | 24.121 |
| 12.499837172027778 | 24.11 |
| 12.502896513666666 | 24.121 |
| 12.505956688722222 | 24.11 |
| 12.509017141527778 | 24.11 |
| 12.512087872722223 | 24.11 |
| 12.515147492166667 | 24.11 |
| 12.51821183411111 | 24.099 |
| 12.521271731333332 | 24.089 |
| 12.524331073 | 24.099 |
| 12.527390414638889 | 24.089 |
| 12.530451978638888 | 24.121 |
| 12.533512431472223 | 24.11 |
| 12.536572050916666 | 24.11 |
| 12.53963333711111 | 24.121 |
| 12.5426957345 | 24.121 |
| 12.545757854083334 | 24.11 |
| 12.548818306916667 | 24.099 |
| 12.551878481944446 | 24.099 |
| 12.554937823611112 | 24.121 |
| 12.557997443055555 | 24.099 |
| 12.56105734027778 | 24.121 |
| 12.56411779311111 | 24.11 |
| 12.567177412555555 | 24.121 |
| 12.570237032 | 24.131 |
| 12.57329637363889 | 24.131 |
| 12.576358215444444 | 24.142 |
| 12.579418390472222 | 24.142 |
| 12.582483287999999 | 24.131 |
| 12.585550685666666 | 24.121 |
| 12.588610027333333 | 24.142 |
| 12.591674647055555 | 24.121 |
| 12.5947342665 | 24.131 |
| 12.597797497250001 | 24.131 |
| 12.600857672277778 | 24.131 |
| 12.603918125111113 | 24.142 |
| 12.60697830013889 | 24.131 |
| 12.610047920166668 | 24.153 |
| 12.613109206361113 | 24.131 |
| 12.616168548027778 | 24.142 |
| 12.619240112583332 | 24.142 |
| 12.622300843222222 | 24.131 |
| 12.625362685 | 24.131 |
| 12.628425637972223 | 24.131 |
| 12.631484701833333 | 24.121 |
| 12.634547932583333 | 24.121 |
| 12.637607552027779 | 24.11 |
| 12.640668838249999 | 24.089 |
| 12.64373040225 | 24.121 |
| 12.646794744194445 | 24.11 |
| 12.649862141861112 | 24.099 |
| 12.652929817305555 | 24.078 |
| 12.655991936888888 | 24.089 |
| 12.659052389722222 | 24.089 |
| 12.662112842555556 | 24.099 |
| 12.665172184194445 | 24.11 |
| 12.668232359222221 | 24.131 |
| 12.671292534277777 | 24.121 |
| 12.674351875916667 | 24.11 |
| 12.677417051222223 | 24.11 |
| 12.680485282277779 | 24.142 |
| 12.683551290972222 | 24.11 |
| 12.686613132777778 | 24.121 |
| 12.689680252638889 | 24.121 |
| 12.692739872083333 | 24.131 |
| 12.695805603 | 24.11 |
| 12.698866333611111 | 24.099 |
| 12.701934286861112 | 24.11 |
| 12.704997795444445 | 24.142 |
| 12.70805824825 | 24.11 |
| 12.711117312111112 | 24.131 |
| 12.714185543166668 | 24.121 |
| 12.717246829361113 | 24.11 |
| 12.720308393361112 | 24.131 |
| 12.723371346333334 | 24.099 |
| 12.726431799166665 | 24.131 |
| 12.729491418611111 | 24.131 |
| 12.732552427027777 | 24.163 |
| 12.735612046472221 | 24.142 |
| 12.738682777666666 | 24.131 |
| 12.741745452833333 | 24.153 |
| 12.744805072277778 | 24.131 |
| 12.747865802888889 | 24.131 |
| 12.750926255722222 | 24.142 |
| 12.753986152972221 | 24.131 |
| 12.75707521852778 | 24.153 |
| 12.760135115777777 | 24.163 |
| 12.7631997355 | 24.153 |
| 12.76627630036111 | 24.131 |
| 12.769337864361113 | 24.142 |
| 12.77239803938889 | 24.131 |
| 12.775457381055556 | 24.142 |
| 12.77851783386111 | 24.142 |
| 12.781586064916667 | 24.131 |
| 12.784645962166667 | 24.131 |
| 12.7877097485 | 24.131 |
| 12.79077770175 | 24.131 |
| 12.793842877083334 | 24.131 |
| 12.796913330472222 | 24.131 |
| 12.799978505805555 | 24.131 |
| 12.803046459055555 | 24.131 |
| 12.8061141345 | 24.099 |
| 12.809183198944446 | 24.131 |
| 12.812258374833334 | 24.121 |
| 12.815318272055556 | 24.131 |
| 12.818379558277776 | 24.131 |
| 12.8214394555 | 24.121 |
| 12.824510186694445 | 24.121 |
| 12.827569528361112 | 24.099 |
| 12.830630814555557 | 24.121 |
| 12.833694323111112 | 24.121 |
| 12.83675366477778 | 24.121 |
| 12.839814117583334 | 24.131 |
| 12.842877070555554 | 24.11 |
| 12.845946968361112 | 24.089 |
| 12.849011032527779 | 24.11 |
| 12.852072874305554 | 24.121 |
| 12.855138605222223 | 24.099 |
| 12.858199058055556 | 24.099 |
| 12.861260066444444 | 24.131 |
| 12.86431940811111 | 24.11 |
| 12.867383194444445 | 24.11 |
| 12.870444480666666 | 24.089 |
| 12.873510211555555 | 24.131 |
| 12.876573164527777 | 24.089 |
| 12.879632506194444 | 24.121 |
| 12.882698514888888 | 24.153 |
| 12.885776468722222 | 24.121 |
| 12.88883581036111 | 24.121 |
| 12.8918998745 | 24.121 |
| 12.894961994083333 | 24.099 |
| 12.898023280305555 | 24.11 |
| 12.901112623666666 | 24.11 |
| 12.904182799277777 | 24.089 |
| 12.907247418999999 | 24.11 |
| 12.910308149611112 | 24.121 |
| 12.913375547277777 | 24.131 |
| 12.916438222472223 | 24.142 |
| 12.919503397777778 | 24.131 |
| 12.922564684 | 24.131 |
| 12.925625136805557 | 24.121 |
| 12.928698368138889 | 24.153 |
| 12.931761043333333 | 24.131 |
| 12.93482455188889 | 24.142 |
| 12.937885004694445 | 24.142 |
| 12.940946290916667 | 24.153 |
| 12.944008966083333 | 24.131 |
| 12.947069141111111 | 24.142 |
| 12.950134316444444 | 24.153 |
| 12.953195047055557 | 24.153 |
| 12.956269667361111 | 24.153 |
| 12.959354288222222 | 24.142 |
| 12.96241529663889 | 24.121 |
| 12.965478527416668 | 24.131 |
| 12.968543147138888 | 24.142 |
| 12.971606100111112 | 24.131 |
| 12.974665719555556 | 24.142 |
| 12.97773561736111 | 24.131 |
| 12.980794959027778 | 24.131 |
| 12.983855134055554 | 24.153 |
| 12.986921698333333 | 24.142 |
| 12.989981317777778 | 24.142 |
| 12.993046770888888 | 24.153 |
| 12.996115835305556 | 24.153 |
| 12.999187955472221 | 24.153 |
| 13.002248408305556 | 24.142 |
| 13.00532302861111 | 24.142 |
| 13.008382648055557 | 24.142 |
| 13.011443378666668 | 24.131 |
| 13.014510776333335 | 24.142 |
| 13.017577896222223 | 24.142 |
| 13.020640015805556 | 24.131 |
| 13.023711858166665 | 24.131 |
| 13.026781478194444 | 24.131 |
| 13.02984109763889 | 24.131 |
| 13.032902939416665 | 24.121 |
| 13.03597144825 | 24.121 |
| 13.039031623305556 | 24.121 |
| 13.04209374288889 | 24.131 |
| 13.045153640111112 | 24.121 |
| 13.048247705972221 | 24.131 |
| 13.051307603222222 | 24.131 |
| 13.05436777825 | 24.142 |
| 13.057432953555557 | 24.142 |
| 13.060492850805556 | 24.131 |
| 13.063554137 | 24.131 |
| 13.06663153525 | 24.131 |
| 13.069701155277778 | 24.153 |
| 13.072767719555555 | 24.142 |
| 13.075828172388889 | 24.153 |
| 13.078889180805556 | 24.131 |
| 13.08195213375 | 24.142 |
| 13.085012308805556 | 24.131 |
| 13.088071372666667 | 24.131 |
| 13.091142937222221 | 24.142 |
| 13.094202834472222 | 24.131 |
| 13.09727023213889 | 24.131 |
| 13.100358464333333 | 24.142 |
| 13.103422250666666 | 24.142 |
| 13.106488259361111 | 24.142 |
| 13.109553712472223 | 24.142 |
| 13.112619165583334 | 24.142 |
| 13.115685174305556 | 24.153 |
| 13.118744515944444 | 24.153 |
| 13.121806635527777 | 24.142 |
| 13.12486792175 | 24.131 |
| 13.127934208222221 | 24.131 |
| 13.13102355161111 | 24.142 |
| 13.13408456 | 24.131 |
| 13.137157235750001 | 24.142 |
| 13.140222966666666 | 24.142 |
| 13.143289253166667 | 24.142 |
| 13.146356650833333 | 24.153 |
| 13.149426270833333 | 24.153 |
| 13.152516725388889 | 24.142 |
| 13.155577733805554 | 24.153 |
| 13.158640131166667 | 24.153 |
| 13.16170141738889 | 24.163 |
| 13.164763259166666 | 24.142 |
| 13.167832323611112 | 24.142 |
| 13.170894721 | 24.153 |
| 13.173966841138888 | 24.142 |
| 13.177036183361112 | 24.142 |
| 13.18009858075 | 24.131 |
| 13.183160422555554 | 24.153 |
| 13.186220319777778 | 24.153 |
| 13.189282717166668 | 24.153 |
| 13.19234400336111 | 24.142 |
| 13.195404178416666 | 24.131 |
| 13.198465742416667 | 24.142 |
| 13.20152952875 | 24.121 |
| 13.20459025936111 | 24.131 |
| 13.207676547 | 24.121 |
| 13.210741166750001 | 24.131 |
| 13.21382578761111 | 24.131 |
| 13.216886240444445 | 24.131 |
| 13.219948915611111 | 24.121 |
| 13.223010479611112 | 24.099 |
| 13.226071210250002 | 24.121 |
| 13.229135274388888 | 24.121 |
| 13.232197949555555 | 24.131 |
| 13.235260346944445 | 24.11 |
| 13.238320244166665 | 24.099 |
| 13.241380419194446 | 24.131 |
| 13.244440316444443 | 24.121 |
| 13.247502436027776 | 24.121 |
| 13.250571222666666 | 24.099 |
| 13.253633620055556 | 24.131 |
| 13.256698239777776 | 24.121 |
| 13.259757581444445 | 24.121 |
| 13.262817200888888 | 24.11 |
| 13.265876264722221 | 24.11 |
| 13.268936717555555 | 24.121 |
| 13.271996059222221 | 24.121 |
| 13.275059012166668 | 24.099 |
| 13.278122242944445 | 24.121 |
| 13.281187696055555 | 24.121 |
| 13.284247315499998 | 24.121 |
| 13.287307490527779 | 24.099 |
| 13.290369887916667 | 24.121 |
| 13.293430896333332 | 24.121 |
| 13.29649607163889 | 24.121 |
| 13.29957096975 | 24.131 |
| 13.302638922999998 | 24.131 |
| 13.305698264638888 | 24.131 |
| 13.308760939805556 | 24.131 |
| 13.311822781611111 | 24.121 |
| 13.31489240163889 | 24.121 |
| 13.317954243416667 | 24.131 |
| 13.321016918611111 | 24.142 |
| 13.324080982749999 | 24.121 |
| 13.327142546749998 | 24.131 |
| 13.330201888388888 | 24.153 |
| 13.333268452666667 | 24.142 |
| 13.336328349916668 | 24.121 |
| 13.33938796936111 | 24.131 |
| 13.342448699972222 | 24.131 |
| 13.345513875305555 | 24.131 |
| 13.348574883722224 | 24.131 |
| 13.351636169916668 | 24.131 |
| 13.354698567305556 | 24.142 |
| 13.357759297916667 | 24.153 |
| 13.360818917361112 | 24.131 |
| 13.363882703722224 | 24.153 |
| 13.366942045361112 | 24.153 |
| 13.370001387027777 | 24.142 |
| 13.373061839833333 | 24.131 |
| 13.376123126055557 | 24.163 |
| 13.379185523416666 | 24.153 |
| 13.382244587277778 | 24.131 |
| 13.385309762611111 | 24.121 |
| 13.388371882194445 | 24.142 |
| 13.39143316838889 | 24.131 |
| 13.394492510055557 | 24.131 |
| 13.397554074055556 | 24.142 |
| 13.40061536025 | 24.153 |
| 13.40367609088889 | 24.131 |
| 13.406735154722222 | 24.131 |
| 13.409795607555557 | 24.142 |
| 13.412858282722222 | 24.131 |
| 13.415918457777778 | 24.131 |
| 13.418981410722223 | 24.131 |
| 13.422041030166666 | 24.131 |
| 13.42510231638889 | 24.131 |
| 13.4281677695 | 24.142 |
| 13.43122711113889 | 24.121 |
| 13.434288397361112 | 24.131 |
| 13.437348016805556 | 24.121 |
| 13.440407358444444 | 24.131 |
| 13.443469478027778 | 24.131 |
| 13.446532153222224 | 24.121 |
| 13.449592050444444 | 24.131 |
| 13.452653336666666 | 24.153 |
| 13.455713789472224 | 24.153 |
| 13.458775075694444 | 24.142 |
| 13.461848029222221 | 24.153 |
| 13.464915426888888 | 24.153 |
| 13.467974768555555 | 24.142 |
| 13.47103855488889 | 24.131 |
| 13.474098174333333 | 24.142 |
| 13.47715918275 | 24.131 |
| 13.480225747055556 | 24.131 |
| 13.483289255611112 | 24.121 |
| 13.486349708416666 | 24.121 |
| 13.48941266138889 | 24.121 |
| 13.492480336861112 | 24.11 |
| 13.495552179222221 | 24.11 |
| 13.498614576611113 | 24.11 |
| 13.501680585305557 | 24.131 |
| 13.504741593722223 | 24.099 |
| 13.507813436083334 | 24.121 |
| 13.51087361111111 | 24.131 |
| 13.513933230555557 | 24.131 |
| 13.516993127805554 | 24.131 |
| 13.5200591365 | 24.11 |
| 13.52312208947222 | 24.121 |
| 13.526182820083333 | 24.11 |
| 13.529242995111112 | 24.11 |
| 13.5323053925 | 24.089 |
| 13.535365845333333 | 24.11 |
| 13.538425464777779 | 24.11 |
| 13.541491195666666 | 24.11 |
| 13.544552204083333 | 24.11 |
| 13.547626824388889 | 24.089 |
| 13.55068588825 | 24.099 |
| 13.55374745225 | 24.11 |
| 13.556818461222223 | 24.067 |
| 13.559883080972224 | 24.089 |
| 13.562944922749999 | 24.089 |
| 13.566004542194444 | 24.089 |
| 13.569066106194445 | 24.089 |
| 13.572126281222223 | 24.067 |
| 13.575187011861113 | 24.078 |
| 13.578246631305555 | 24.089 |
| 13.581314584555557 | 24.057 |
| 13.584387815888888 | 24.089 |
| 13.587449102083333 | 24.078 |
| 13.59050844375 | 24.067 |
| 13.593587786527777 | 24.057 |
| 13.596649350527779 | 24.067 |
| 13.599710081166666 | 24.067 |
| 13.602769422805554 | 24.078 |
| 13.605829597833333 | 24.067 |
| 13.608893384194445 | 24.057 |
| 13.611953281416667 | 24.067 |
| 13.615016512194444 | 24.057 |
| 13.618088076749999 | 24.067 |
| 13.621151029722222 | 24.067 |
| 13.624217316222223 | 24.046 |
| 13.627287214027778 | 24.067 |
| 13.630349889222222 | 24.057 |
| 13.633410342027778 | 24.067 |
| 13.636471072666668 | 24.046 |
| 13.63953402561111 | 24.035 |
| 13.642595867416667 | 24.046 |
| 13.645682710638889 | 24.035 |
| 13.648744274638888 | 24.046 |
| 13.651809172166665 | 24.035 |
| 13.65487045836111 | 24.035 |
| 13.657930633416667 | 24.024 |
| 13.660991364027778 | 24.046 |
| 13.664054594777777 | 24.046 |
| 13.667114214222222 | 24.046 |
| 13.67017827836111 | 24.035 |
| 13.673240953555556 | 24.046 |
| 13.676300850777778 | 24.046 |
| 13.679361859194444 | 24.057 |
| 13.682421478638888 | 24.046 |
| 13.6854805425 | 24.046 |
| 13.688540717527777 | 24.035 |
| 13.6916036705 | 24.035 |
| 13.694666901277778 | 24.035 |
| 13.697739854805556 | 24.024 |
| 13.700800307638888 | 24.024 |
| 13.703861316055557 | 24.035 |
| 13.706927046944445 | 24.003 |
| 13.709988610944444 | 24.024 |
| 13.713054897444444 | 24.035 |
| 13.71611590586111 | 24.024 |
| 13.719177192055556 | 24.035 |
| 13.722242922972223 | 24.046 |
| 13.725304486972222 | 24.014 |
| 13.728366606555555 | 24.067 |
| 13.731426503805556 | 24.035 |
| 13.734485845444445 | 24.024 |
| 13.737548798416666 | 24.035 |
| 13.740613695944445 | 24.035 |
| 13.74367498213889 | 24.035 |
| 13.746736546138889 | 24.046 |
| 13.749796165583332 | 24.035 |
| 13.752859396361112 | 24.035 |
| 13.755923738277778 | 24.035 |
| 13.758993913888888 | 24.024 |
| 13.76205686686111 | 24.046 |
| 13.765118430861111 | 24.046 |
| 13.768181661638888 | 24.035 |
| 13.771242947833333 | 24.046 |
| 13.774304511833332 | 24.035 |
| 13.777367742583333 | 24.057 |
| 13.780433195694444 | 24.067 |
| 13.783495315305556 | 24.046 |
| 13.786555490333333 | 24.057 |
| 13.789617332111112 | 24.057 |
| 13.79267750713889 | 24.067 |
| 13.795742682472222 | 24.067 |
| 13.798807302194444 | 24.089 |
| 13.801866643861112 | 24.078 |
| 13.8049259855 | 24.067 |
| 13.807987271722222 | 24.067 |
| 13.811050780277776 | 24.099 |
| 13.81411234427778 | 24.099 |
| 13.817175019444445 | 24.089 |
| 13.820235194472223 | 24.121 |
| 13.823296480666666 | 24.089 |
| 13.826358044666668 | 24.121 |
| 13.829421553222224 | 24.131 |
| 13.832482561638889 | 24.121 |
| 13.835545236833333 | 24.131 |
| 13.838605967444446 | 24.142 |